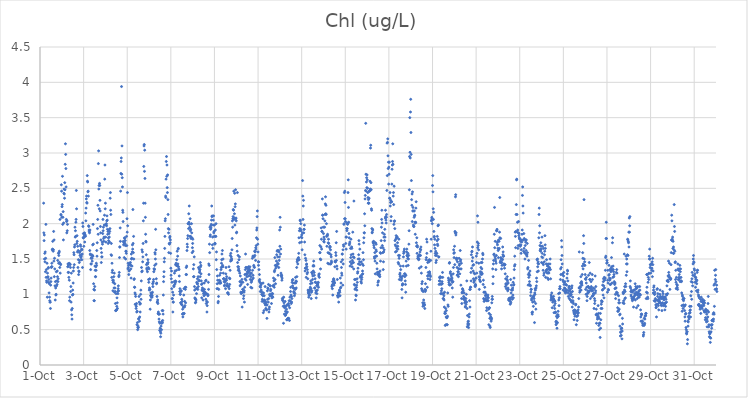
| Category | Chl (ug/L) |
|---|---|
| 44470.166666666664 | 2.29 |
| 44470.177083333336 | 1.87 |
| 44470.1875 | 1.76 |
| 44470.197916666664 | 1.84 |
| 44470.208333333336 | 1.5 |
| 44470.21875 | 1.58 |
| 44470.229166666664 | 1.46 |
| 44470.239583333336 | 1.6 |
| 44470.25 | 1.32 |
| 44470.260416666664 | 1.51 |
| 44470.270833333336 | 1.99 |
| 44470.28125 | 1.24 |
| 44470.291666666664 | 1.35 |
| 44470.302083333336 | 1.19 |
| 44470.3125 | 1.17 |
| 44470.322916666664 | 1.44 |
| 44470.333333333336 | 0.96 |
| 44470.34375 | 1.3 |
| 44470.354166666664 | 1.24 |
| 44470.364583333336 | 1.25 |
| 44470.375 | 1.37 |
| 44470.385416666664 | 1.38 |
| 44470.395833333336 | 1.17 |
| 44470.40625 | 1.21 |
| 44470.416666666664 | 1.02 |
| 44470.427083333336 | 1.15 |
| 44470.4375 | 0.96 |
| 44470.447916666664 | 0.91 |
| 44470.458333333336 | 0.89 |
| 44470.46875 | 0.89 |
| 44470.479166666664 | 0.8 |
| 44470.489583333336 | 1.13 |
| 44470.5 | 1.18 |
| 44470.510416666664 | 1.23 |
| 44470.520833333336 | 1.38 |
| 44470.53125 | 1.39 |
| 44470.541666666664 | 1.44 |
| 44470.552083333336 | 1.39 |
| 44470.5625 | 1.63 |
| 44470.572916666664 | 1.64 |
| 44470.583333333336 | 1.75 |
| 44470.59375 | 1.63 |
| 44470.604166666664 | 1.61 |
| 44470.614583333336 | 1.63 |
| 44470.625 | 1.89 |
| 44470.635416666664 | 1.47 |
| 44470.645833333336 | 1.77 |
| 44470.65625 | 1.25 |
| 44470.666666666664 | 1.51 |
| 44470.677083333336 | 1.36 |
| 44470.6875 | 1.12 |
| 44470.697916666664 | 0.92 |
| 44470.708333333336 | 1.18 |
| 44470.71875 | 1.09 |
| 44470.729166666664 | 0.99 |
| 44470.739583333336 | 1 |
| 44470.75 | 1.32 |
| 44470.760416666664 | 1.12 |
| 44470.770833333336 | 1.19 |
| 44470.78125 | 1.14 |
| 44470.791666666664 | 1.33 |
| 44470.802083333336 | 1.25 |
| 44470.8125 | 1.48 |
| 44470.822916666664 | 1.18 |
| 44470.833333333336 | 1.22 |
| 44470.84375 | 1.58 |
| 44470.854166666664 | 1.44 |
| 44470.864583333336 | 1.55 |
| 44470.875 | 1.59 |
| 44470.885416666664 | 1.61 |
| 44470.895833333336 | 1.45 |
| 44470.90625 | 1.38 |
| 44470.916666666664 | 2.06 |
| 44470.927083333336 | 1.3 |
| 44470.9375 | 1.43 |
| 44470.947916666664 | 1.42 |
| 44470.958333333336 | 2.13 |
| 44470.96875 | 2.12 |
| 44470.979166666664 | 2.55 |
| 44470.989583333336 | 2.46 |
| 44471.0 | 2.09 |
| 44471.010416666664 | 2.24 |
| 44471.020833333336 | 2.27 |
| 44471.03125 | 2.67 |
| 44471.041666666664 | 1.99 |
| 44471.052083333336 | 2.09 |
| 44471.0625 | 2.17 |
| 44471.072916666664 | 1.77 |
| 44471.083333333336 | 2.01 |
| 44471.09375 | 2.43 |
| 44471.104166666664 | 2.49 |
| 44471.114583333336 | 2.42 |
| 44471.125 | 2.36 |
| 44471.135416666664 | 2.58 |
| 44471.145833333336 | 2.48 |
| 44471.15625 | 2.84 |
| 44471.166666666664 | 3.13 |
| 44471.177083333336 | 2.98 |
| 44471.1875 | 2.78 |
| 44471.197916666664 | 2.52 |
| 44471.208333333336 | 2.06 |
| 44471.21875 | 2.03 |
| 44471.229166666664 | 1.87 |
| 44471.239583333336 | 2.04 |
| 44471.25 | 1.9 |
| 44471.260416666664 | 1.99 |
| 44471.270833333336 | 1.39 |
| 44471.28125 | 1.43 |
| 44471.291666666664 | 1.31 |
| 44471.302083333336 | 1.4 |
| 44471.3125 | 1.31 |
| 44471.322916666664 | 1.24 |
| 44471.333333333336 | 1.44 |
| 44471.34375 | 1.2 |
| 44471.354166666664 | 0.91 |
| 44471.364583333336 | 0.96 |
| 44471.375 | 1.43 |
| 44471.385416666664 | 1.42 |
| 44471.395833333336 | 1.38 |
| 44471.40625 | 1.04 |
| 44471.416666666664 | 1.11 |
| 44471.427083333336 | 0.89 |
| 44471.4375 | 1.3 |
| 44471.447916666664 | 0.78 |
| 44471.458333333336 | 0.71 |
| 44471.46875 | 0.65 |
| 44471.479166666664 | 0.8 |
| 44471.489583333336 | 0.99 |
| 44471.5 | 1.06 |
| 44471.510416666664 | 1 |
| 44471.520833333336 | 1.16 |
| 44471.53125 | 1.33 |
| 44471.541666666664 | 1.38 |
| 44471.552083333336 | 1.59 |
| 44471.5625 | 1.56 |
| 44471.572916666664 | 1.42 |
| 44471.583333333336 | 1.67 |
| 44471.59375 | 1.7 |
| 44471.604166666664 | 1.95 |
| 44471.614583333336 | 1.81 |
| 44471.625 | 1.9 |
| 44471.635416666664 | 1.82 |
| 44471.645833333336 | 2.02 |
| 44471.65625 | 2.06 |
| 44471.666666666664 | 2.47 |
| 44471.677083333336 | 2.21 |
| 44471.6875 | 1.72 |
| 44471.697916666664 | 1.83 |
| 44471.708333333336 | 1.75 |
| 44471.71875 | 1.6 |
| 44471.729166666664 | 1.68 |
| 44471.739583333336 | 1.38 |
| 44471.75 | 1.62 |
| 44471.760416666664 | 1.49 |
| 44471.770833333336 | 1.28 |
| 44471.78125 | 1.33 |
| 44471.791666666664 | 1.32 |
| 44471.802083333336 | 1.45 |
| 44471.8125 | 1.59 |
| 44471.822916666664 | 1.48 |
| 44471.833333333336 | 1.55 |
| 44471.84375 | 1.61 |
| 44471.854166666664 | 1.7 |
| 44471.864583333336 | 1.68 |
| 44471.875 | 1.52 |
| 44471.885416666664 | 1.56 |
| 44471.895833333336 | 1.54 |
| 44471.90625 | 1.64 |
| 44471.916666666664 | 1.49 |
| 44471.927083333336 | 1.63 |
| 44471.9375 | 1.57 |
| 44471.947916666664 | 1.38 |
| 44471.958333333336 | 2.01 |
| 44471.96875 | 1.96 |
| 44471.979166666664 | 1.8 |
| 44471.989583333336 | 1.86 |
| 44472.0 | 1.8 |
| 44472.010416666664 | 1.68 |
| 44472.020833333336 | 1.82 |
| 44472.03125 | 1.86 |
| 44472.041666666664 | 1.87 |
| 44472.052083333336 | 1.74 |
| 44472.0625 | 1.83 |
| 44472.072916666664 | 1.84 |
| 44472.083333333336 | 1.82 |
| 44472.09375 | 2.15 |
| 44472.104166666664 | 2.04 |
| 44472.114583333336 | 2.22 |
| 44472.125 | 2.35 |
| 44472.135416666664 | 2.39 |
| 44472.145833333336 | 2.3 |
| 44472.15625 | 2.29 |
| 44472.166666666664 | 2.68 |
| 44472.177083333336 | 2.6 |
| 44472.1875 | 2.59 |
| 44472.197916666664 | 2.45 |
| 44472.208333333336 | 2.46 |
| 44472.21875 | 2.39 |
| 44472.229166666664 | 1.97 |
| 44472.239583333336 | 1.96 |
| 44472.25 | 1.91 |
| 44472.260416666664 | 1.89 |
| 44472.270833333336 | 1.87 |
| 44472.28125 | 1.62 |
| 44472.291666666664 | 1.91 |
| 44472.302083333336 | 1.57 |
| 44472.3125 | 1.56 |
| 44472.322916666664 | 1.35 |
| 44472.333333333336 | 1.43 |
| 44472.34375 | 1.51 |
| 44472.354166666664 | 1.43 |
| 44472.364583333336 | 1.52 |
| 44472.375 | 1.56 |
| 44472.385416666664 | 1.51 |
| 44472.395833333336 | 1.47 |
| 44472.40625 | 1.55 |
| 44472.416666666664 | 1.7 |
| 44472.427083333336 | 1.54 |
| 44472.4375 | 1.99 |
| 44472.447916666664 | 1.71 |
| 44472.458333333336 | 1.15 |
| 44472.46875 | 1.07 |
| 44472.479166666664 | 0.91 |
| 44472.489583333336 | 0.91 |
| 44472.5 | 1.06 |
| 44472.510416666664 | 1.11 |
| 44472.520833333336 | 1.4 |
| 44472.53125 | 1.34 |
| 44472.541666666664 | 1.25 |
| 44472.552083333336 | 1.25 |
| 44472.5625 | 1.39 |
| 44472.572916666664 | 1.34 |
| 44472.583333333336 | 1.44 |
| 44472.59375 | 1.41 |
| 44472.604166666664 | 1.62 |
| 44472.614583333336 | 1.54 |
| 44472.625 | 1.73 |
| 44472.635416666664 | 1.93 |
| 44472.645833333336 | 2.06 |
| 44472.65625 | 2.26 |
| 44472.666666666664 | 1.85 |
| 44472.677083333336 | 2.85 |
| 44472.6875 | 3.03 |
| 44472.697916666664 | 2.49 |
| 44472.708333333336 | 2.54 |
| 44472.71875 | 2.21 |
| 44472.729166666664 | 2.57 |
| 44472.739583333336 | 2.54 |
| 44472.75 | 2.33 |
| 44472.760416666664 | 2.18 |
| 44472.770833333336 | 1.96 |
| 44472.78125 | 1.87 |
| 44472.791666666664 | 1.77 |
| 44472.802083333336 | 1.65 |
| 44472.8125 | 1.45 |
| 44472.822916666664 | 1.59 |
| 44472.833333333336 | 1.53 |
| 44472.84375 | 1.53 |
| 44472.854166666664 | 1.74 |
| 44472.864583333336 | 1.71 |
| 44472.875 | 1.86 |
| 44472.885416666664 | 2.06 |
| 44472.895833333336 | 1.9 |
| 44472.90625 | 1.95 |
| 44472.916666666664 | 1.79 |
| 44472.927083333336 | 1.75 |
| 44472.9375 | 1.81 |
| 44472.947916666664 | 1.98 |
| 44472.958333333336 | 2.12 |
| 44472.96875 | 2.63 |
| 44472.979166666664 | 2.83 |
| 44472.989583333336 | 2.21 |
| 44473.0 | 2.29 |
| 44473.010416666664 | 1.81 |
| 44473.020833333336 | 1.74 |
| 44473.03125 | 1.99 |
| 44473.041666666664 | 2 |
| 44473.052083333336 | 1.97 |
| 44473.0625 | 2.04 |
| 44473.072916666664 | 2.11 |
| 44473.083333333336 | 2.05 |
| 44473.09375 | 1.92 |
| 44473.104166666664 | 1.85 |
| 44473.114583333336 | 1.89 |
| 44473.125 | 1.72 |
| 44473.135416666664 | 1.8 |
| 44473.145833333336 | 1.76 |
| 44473.15625 | 1.91 |
| 44473.166666666664 | 1.86 |
| 44473.177083333336 | 1.81 |
| 44473.1875 | 1.74 |
| 44473.197916666664 | 1.89 |
| 44473.208333333336 | 1.93 |
| 44473.21875 | 2.36 |
| 44473.229166666664 | 2.44 |
| 44473.239583333336 | 2.19 |
| 44473.25 | 2.13 |
| 44473.260416666664 | 1.56 |
| 44473.270833333336 | 1.72 |
| 44473.28125 | 1.55 |
| 44473.291666666664 | 1.24 |
| 44473.302083333336 | 1.44 |
| 44473.3125 | 1.31 |
| 44473.322916666664 | 1.34 |
| 44473.333333333336 | 1.2 |
| 44473.34375 | 1.05 |
| 44473.354166666664 | 1.17 |
| 44473.364583333336 | 1.2 |
| 44473.375 | 1.17 |
| 44473.385416666664 | 1.25 |
| 44473.395833333336 | 1.09 |
| 44473.40625 | 1.3 |
| 44473.416666666664 | 1.03 |
| 44473.427083333336 | 1.15 |
| 44473.4375 | 1.09 |
| 44473.447916666664 | 1.04 |
| 44473.458333333336 | 0.87 |
| 44473.46875 | 0.77 |
| 44473.479166666664 | 0.77 |
| 44473.489583333336 | 1.01 |
| 44473.5 | 0.78 |
| 44473.510416666664 | 0.78 |
| 44473.520833333336 | 0.83 |
| 44473.53125 | 0.95 |
| 44473.541666666664 | 0.88 |
| 44473.552083333336 | 0.8 |
| 44473.5625 | 1.04 |
| 44473.572916666664 | 1.01 |
| 44473.583333333336 | 1.08 |
| 44473.59375 | 1.12 |
| 44473.604166666664 | 1.05 |
| 44473.614583333336 | 1.25 |
| 44473.625 | 1.27 |
| 44473.635416666664 | 1.31 |
| 44473.645833333336 | 1.52 |
| 44473.65625 | 1.67 |
| 44473.666666666664 | 1.67 |
| 44473.677083333336 | 1.94 |
| 44473.6875 | 1.75 |
| 44473.697916666664 | 2.46 |
| 44473.708333333336 | 2.71 |
| 44473.71875 | 2.88 |
| 44473.729166666664 | 2.93 |
| 44473.739583333336 | 3.94 |
| 44473.75 | 2.7 |
| 44473.760416666664 | 3.1 |
| 44473.770833333336 | 2.65 |
| 44473.78125 | 2.52 |
| 44473.791666666664 | 2.19 |
| 44473.802083333336 | 2.16 |
| 44473.8125 | 2.03 |
| 44473.822916666664 | 1.75 |
| 44473.833333333336 | 1.7 |
| 44473.84375 | 1.73 |
| 44473.854166666664 | 1.74 |
| 44473.864583333336 | 1.52 |
| 44473.875 | 1.8 |
| 44473.885416666664 | 1.79 |
| 44473.895833333336 | 1.72 |
| 44473.90625 | 1.76 |
| 44473.916666666664 | 1.69 |
| 44473.927083333336 | 1.5 |
| 44473.9375 | 1.61 |
| 44473.947916666664 | 1.61 |
| 44473.958333333336 | 1.58 |
| 44473.96875 | 1.82 |
| 44473.979166666664 | 1.69 |
| 44473.989583333336 | 2.07 |
| 44474.0 | 1.88 |
| 44474.010416666664 | 2.44 |
| 44474.020833333336 | 1.97 |
| 44474.03125 | 1.36 |
| 44474.041666666664 | 1.44 |
| 44474.052083333336 | 1.38 |
| 44474.0625 | 1.41 |
| 44474.072916666664 | 1.28 |
| 44474.083333333336 | 1.33 |
| 44474.09375 | 1.42 |
| 44474.104166666664 | 1.34 |
| 44474.114583333336 | 1.44 |
| 44474.125 | 1.42 |
| 44474.135416666664 | 1.42 |
| 44474.145833333336 | 1.45 |
| 44474.15625 | 1.41 |
| 44474.166666666664 | 1.36 |
| 44474.177083333336 | 1.23 |
| 44474.1875 | 1.57 |
| 44474.197916666664 | 1.5 |
| 44474.208333333336 | 1.51 |
| 44474.21875 | 1.4 |
| 44474.229166666664 | 1.6 |
| 44474.239583333336 | 1.7 |
| 44474.25 | 1.64 |
| 44474.260416666664 | 2.2 |
| 44474.270833333336 | 1.72 |
| 44474.28125 | 1.59 |
| 44474.291666666664 | 1.82 |
| 44474.302083333336 | 1.5 |
| 44474.3125 | 1.21 |
| 44474.322916666664 | 1.22 |
| 44474.333333333336 | 1.1 |
| 44474.34375 | 1.1 |
| 44474.354166666664 | 1.02 |
| 44474.364583333336 | 0.86 |
| 44474.375 | 1 |
| 44474.385416666664 | 0.97 |
| 44474.395833333336 | 0.85 |
| 44474.40625 | 0.8 |
| 44474.416666666664 | 0.83 |
| 44474.427083333336 | 0.87 |
| 44474.4375 | 0.75 |
| 44474.447916666664 | 0.57 |
| 44474.458333333336 | 0.76 |
| 44474.46875 | 0.6 |
| 44474.479166666664 | 0.5 |
| 44474.489583333336 | 0.53 |
| 44474.5 | 0.55 |
| 44474.510416666664 | 0.53 |
| 44474.520833333336 | 0.65 |
| 44474.53125 | 0.66 |
| 44474.541666666664 | 0.97 |
| 44474.552083333336 | 0.89 |
| 44474.5625 | 0.62 |
| 44474.572916666664 | 0.68 |
| 44474.583333333336 | 0.86 |
| 44474.59375 | 0.75 |
| 44474.604166666664 | 0.87 |
| 44474.614583333336 | 1 |
| 44474.625 | 1.06 |
| 44474.635416666664 | 0.93 |
| 44474.645833333336 | 1.19 |
| 44474.65625 | 1.38 |
| 44474.666666666664 | 1.32 |
| 44474.677083333336 | 1.63 |
| 44474.6875 | 1.33 |
| 44474.697916666664 | 1.6 |
| 44474.708333333336 | 1.46 |
| 44474.71875 | 1.53 |
| 44474.729166666664 | 1.72 |
| 44474.739583333336 | 2.04 |
| 44474.75 | 2.29 |
| 44474.760416666664 | 2.81 |
| 44474.770833333336 | 3.1 |
| 44474.78125 | 3.12 |
| 44474.791666666664 | 2.74 |
| 44474.802083333336 | 3.04 |
| 44474.8125 | 2.64 |
| 44474.822916666664 | 2.29 |
| 44474.833333333336 | 2.09 |
| 44474.84375 | 1.85 |
| 44474.854166666664 | 1.75 |
| 44474.864583333336 | 1.74 |
| 44474.875 | 1.56 |
| 44474.885416666664 | 1.42 |
| 44474.895833333336 | 1.37 |
| 44474.90625 | 1.35 |
| 44474.916666666664 | 1.44 |
| 44474.927083333336 | 1.32 |
| 44474.9375 | 1.43 |
| 44474.947916666664 | 1.49 |
| 44474.958333333336 | 1.45 |
| 44474.96875 | 1.38 |
| 44474.979166666664 | 1.21 |
| 44474.989583333336 | 1.17 |
| 44475.0 | 1.36 |
| 44475.010416666664 | 1.06 |
| 44475.020833333336 | 1.09 |
| 44475.03125 | 1.22 |
| 44475.041666666664 | 1.07 |
| 44475.052083333336 | 0.79 |
| 44475.0625 | 0.92 |
| 44475.072916666664 | 0.98 |
| 44475.083333333336 | 1.02 |
| 44475.09375 | 0.99 |
| 44475.104166666664 | 0.98 |
| 44475.114583333336 | 0.96 |
| 44475.125 | 1.01 |
| 44475.135416666664 | 0.96 |
| 44475.145833333336 | 0.98 |
| 44475.15625 | 1.03 |
| 44475.166666666664 | 1.15 |
| 44475.177083333336 | 1.11 |
| 44475.1875 | 1.16 |
| 44475.197916666664 | 1.18 |
| 44475.208333333336 | 1.21 |
| 44475.21875 | 1.32 |
| 44475.229166666664 | 1.36 |
| 44475.239583333336 | 1.36 |
| 44475.25 | 1.35 |
| 44475.260416666664 | 1.41 |
| 44475.270833333336 | 1.59 |
| 44475.28125 | 1.57 |
| 44475.291666666664 | 1.5 |
| 44475.302083333336 | 1.92 |
| 44475.3125 | 1.63 |
| 44475.322916666664 | 1.43 |
| 44475.333333333336 | 1.22 |
| 44475.34375 | 1.15 |
| 44475.354166666664 | 1.16 |
| 44475.364583333336 | 0.97 |
| 44475.375 | 0.89 |
| 44475.385416666664 | 0.89 |
| 44475.395833333336 | 0.92 |
| 44475.40625 | 0.87 |
| 44475.416666666664 | 0.73 |
| 44475.427083333336 | 0.75 |
| 44475.4375 | 0.72 |
| 44475.447916666664 | 0.72 |
| 44475.458333333336 | 0.65 |
| 44475.46875 | 0.61 |
| 44475.479166666664 | 0.72 |
| 44475.489583333336 | 0.49 |
| 44475.5 | 0.59 |
| 44475.510416666664 | 0.52 |
| 44475.520833333336 | 0.47 |
| 44475.53125 | 0.4 |
| 44475.541666666664 | 0.45 |
| 44475.552083333336 | 0.55 |
| 44475.5625 | 0.6 |
| 44475.572916666664 | 0.5 |
| 44475.583333333336 | 0.59 |
| 44475.59375 | 0.62 |
| 44475.604166666664 | 0.77 |
| 44475.614583333336 | 0.6 |
| 44475.625 | 0.63 |
| 44475.635416666664 | 0.77 |
| 44475.645833333336 | 0.72 |
| 44475.65625 | 0.99 |
| 44475.666666666664 | 1.18 |
| 44475.677083333336 | 1.25 |
| 44475.6875 | 1.32 |
| 44475.697916666664 | 1.46 |
| 44475.708333333336 | 1.51 |
| 44475.71875 | 1.65 |
| 44475.729166666664 | 1.82 |
| 44475.739583333336 | 2.04 |
| 44475.75 | 2.07 |
| 44475.760416666664 | 2.39 |
| 44475.770833333336 | 2.37 |
| 44475.78125 | 2.63 |
| 44475.791666666664 | 2.88 |
| 44475.802083333336 | 2.95 |
| 44475.8125 | 2.67 |
| 44475.822916666664 | 2.83 |
| 44475.833333333336 | 2.51 |
| 44475.84375 | 2.44 |
| 44475.854166666664 | 2.69 |
| 44475.864583333336 | 2.34 |
| 44475.875 | 2.13 |
| 44475.885416666664 | 1.93 |
| 44475.895833333336 | 1.87 |
| 44475.90625 | 1.59 |
| 44475.916666666664 | 1.92 |
| 44475.927083333336 | 1.72 |
| 44475.9375 | 1.71 |
| 44475.947916666664 | 1.8 |
| 44475.958333333336 | 1.82 |
| 44475.96875 | 1.73 |
| 44475.979166666664 | 1.77 |
| 44475.989583333336 | 1.58 |
| 44476.0 | 1.37 |
| 44476.010416666664 | 1.27 |
| 44476.020833333336 | 1.22 |
| 44476.03125 | 1.33 |
| 44476.041666666664 | 1.08 |
| 44476.052083333336 | 1.17 |
| 44476.0625 | 0.94 |
| 44476.072916666664 | 0.94 |
| 44476.083333333336 | 1.03 |
| 44476.09375 | 0.75 |
| 44476.104166666664 | 0.89 |
| 44476.114583333336 | 0.89 |
| 44476.125 | 0.99 |
| 44476.135416666664 | 1.12 |
| 44476.145833333336 | 1.11 |
| 44476.15625 | 1.18 |
| 44476.166666666664 | 1.3 |
| 44476.177083333336 | 1.14 |
| 44476.1875 | 1.33 |
| 44476.197916666664 | 1.16 |
| 44476.208333333336 | 1.19 |
| 44476.21875 | 1.42 |
| 44476.229166666664 | 1.18 |
| 44476.239583333336 | 1.44 |
| 44476.25 | 1.41 |
| 44476.260416666664 | 1.34 |
| 44476.270833333336 | 1.49 |
| 44476.28125 | 1.41 |
| 44476.291666666664 | 1.61 |
| 44476.302083333336 | 1.4 |
| 44476.3125 | 1.54 |
| 44476.322916666664 | 1.43 |
| 44476.333333333336 | 1.64 |
| 44476.34375 | 1.65 |
| 44476.354166666664 | 1.39 |
| 44476.364583333336 | 1.36 |
| 44476.375 | 1.35 |
| 44476.385416666664 | 1.26 |
| 44476.395833333336 | 1.18 |
| 44476.40625 | 1.04 |
| 44476.416666666664 | 1.08 |
| 44476.427083333336 | 1 |
| 44476.4375 | 1 |
| 44476.447916666664 | 0.88 |
| 44476.458333333336 | 1.04 |
| 44476.46875 | 0.88 |
| 44476.479166666664 | 1.05 |
| 44476.489583333336 | 0.86 |
| 44476.5 | 0.93 |
| 44476.510416666664 | 0.85 |
| 44476.520833333336 | 0.9 |
| 44476.53125 | 0.72 |
| 44476.541666666664 | 0.79 |
| 44476.552083333336 | 0.68 |
| 44476.5625 | 0.73 |
| 44476.572916666664 | 0.82 |
| 44476.583333333336 | 0.72 |
| 44476.59375 | 0.99 |
| 44476.604166666664 | 1.08 |
| 44476.614583333336 | 0.73 |
| 44476.625 | 0.82 |
| 44476.635416666664 | 0.9 |
| 44476.645833333336 | 0.84 |
| 44476.65625 | 1.1 |
| 44476.666666666664 | 1.07 |
| 44476.677083333336 | 0.88 |
| 44476.6875 | 1.1 |
| 44476.697916666664 | 1.28 |
| 44476.708333333336 | 1.38 |
| 44476.71875 | 1.28 |
| 44476.729166666664 | 1.4 |
| 44476.739583333336 | 1.62 |
| 44476.75 | 1.71 |
| 44476.760416666664 | 1.67 |
| 44476.770833333336 | 1.79 |
| 44476.78125 | 1.83 |
| 44476.791666666664 | 2 |
| 44476.802083333336 | 2 |
| 44476.8125 | 1.93 |
| 44476.822916666664 | 2.14 |
| 44476.833333333336 | 2.02 |
| 44476.84375 | 2.25 |
| 44476.854166666664 | 1.99 |
| 44476.864583333336 | 1.95 |
| 44476.875 | 1.82 |
| 44476.885416666664 | 2.07 |
| 44476.895833333336 | 1.9 |
| 44476.90625 | 1.82 |
| 44476.916666666664 | 1.92 |
| 44476.927083333336 | 1.79 |
| 44476.9375 | 1.8 |
| 44476.947916666664 | 2 |
| 44476.958333333336 | 1.87 |
| 44476.96875 | 1.8 |
| 44476.979166666664 | 1.59 |
| 44476.989583333336 | 1.66 |
| 44477.0 | 1.72 |
| 44477.010416666664 | 1.78 |
| 44477.020833333336 | 1.61 |
| 44477.03125 | 1.36 |
| 44477.041666666664 | 1.25 |
| 44477.052083333336 | 1.42 |
| 44477.0625 | 1.25 |
| 44477.072916666664 | 1.53 |
| 44477.083333333336 | 1.11 |
| 44477.09375 | 1.06 |
| 44477.104166666664 | 0.95 |
| 44477.114583333336 | 0.94 |
| 44477.125 | 0.88 |
| 44477.135416666664 | 0.93 |
| 44477.145833333336 | 0.89 |
| 44477.15625 | 0.92 |
| 44477.166666666664 | 1.08 |
| 44477.177083333336 | 1.01 |
| 44477.1875 | 1.17 |
| 44477.197916666664 | 1.09 |
| 44477.208333333336 | 1.15 |
| 44477.21875 | 1.22 |
| 44477.229166666664 | 1.15 |
| 44477.239583333336 | 1.07 |
| 44477.25 | 1.25 |
| 44477.260416666664 | 1.11 |
| 44477.270833333336 | 1.38 |
| 44477.28125 | 1.19 |
| 44477.291666666664 | 1.36 |
| 44477.302083333336 | 1.2 |
| 44477.3125 | 1.31 |
| 44477.322916666664 | 1.33 |
| 44477.333333333336 | 1.35 |
| 44477.34375 | 1.25 |
| 44477.354166666664 | 1.45 |
| 44477.364583333336 | 1.39 |
| 44477.375 | 1.41 |
| 44477.385416666664 | 1.29 |
| 44477.395833333336 | 1.19 |
| 44477.40625 | 1.14 |
| 44477.416666666664 | 0.95 |
| 44477.427083333336 | 1.06 |
| 44477.4375 | 1.15 |
| 44477.447916666664 | 1.09 |
| 44477.458333333336 | 1.05 |
| 44477.46875 | 1.06 |
| 44477.479166666664 | 0.92 |
| 44477.489583333336 | 1.07 |
| 44477.5 | 1.01 |
| 44477.510416666664 | 1.04 |
| 44477.520833333336 | 0.98 |
| 44477.53125 | 1.16 |
| 44477.541666666664 | 1.07 |
| 44477.552083333336 | 1.03 |
| 44477.5625 | 1.01 |
| 44477.572916666664 | 1.03 |
| 44477.583333333336 | 1 |
| 44477.59375 | 1.19 |
| 44477.604166666664 | 0.93 |
| 44477.614583333336 | 1.2 |
| 44477.625 | 0.87 |
| 44477.635416666664 | 1.01 |
| 44477.645833333336 | 0.9 |
| 44477.65625 | 0.75 |
| 44477.666666666664 | 0.84 |
| 44477.677083333336 | 0.89 |
| 44477.6875 | 1 |
| 44477.697916666664 | 0.98 |
| 44477.708333333336 | 0.99 |
| 44477.71875 | 1.17 |
| 44477.729166666664 | 1.07 |
| 44477.739583333336 | 1.43 |
| 44477.75 | 1.28 |
| 44477.760416666664 | 1.41 |
| 44477.770833333336 | 1.71 |
| 44477.78125 | 1.59 |
| 44477.791666666664 | 1.95 |
| 44477.802083333336 | 1.82 |
| 44477.8125 | 1.84 |
| 44477.822916666664 | 1.92 |
| 44477.833333333336 | 1.97 |
| 44477.84375 | 1.94 |
| 44477.854166666664 | 1.99 |
| 44477.864583333336 | 2.05 |
| 44477.875 | 2.25 |
| 44477.885416666664 | 2.1 |
| 44477.895833333336 | 2.11 |
| 44477.90625 | 1.7 |
| 44477.916666666664 | 1.81 |
| 44477.927083333336 | 1.65 |
| 44477.9375 | 1.98 |
| 44477.947916666664 | 2.05 |
| 44477.958333333336 | 2.11 |
| 44477.96875 | 1.87 |
| 44477.979166666664 | 1.89 |
| 44477.989583333336 | 1.82 |
| 44478.0 | 1.98 |
| 44478.010416666664 | 1.72 |
| 44478.020833333336 | 1.71 |
| 44478.03125 | 1.72 |
| 44478.041666666664 | 1.91 |
| 44478.052083333336 | 1.82 |
| 44478.0625 | 1.82 |
| 44478.072916666664 | 2 |
| 44478.083333333336 | 1.49 |
| 44478.09375 | 1.6 |
| 44478.104166666664 | 1.35 |
| 44478.114583333336 | 1.08 |
| 44478.125 | 1.15 |
| 44478.135416666664 | 1.26 |
| 44478.145833333336 | 1.2 |
| 44478.15625 | 1.08 |
| 44478.166666666664 | 0.88 |
| 44478.177083333336 | 0.9 |
| 44478.1875 | 0.97 |
| 44478.197916666664 | 1.07 |
| 44478.208333333336 | 1.16 |
| 44478.21875 | 1.2 |
| 44478.229166666664 | 1.16 |
| 44478.239583333336 | 1.27 |
| 44478.25 | 1.18 |
| 44478.260416666664 | 1.19 |
| 44478.270833333336 | 1.16 |
| 44478.28125 | 1.3 |
| 44478.291666666664 | 1.16 |
| 44478.302083333336 | 1.35 |
| 44478.3125 | 1.38 |
| 44478.322916666664 | 1.44 |
| 44478.333333333336 | 1.49 |
| 44478.34375 | 1.57 |
| 44478.354166666664 | 1.39 |
| 44478.364583333336 | 1.62 |
| 44478.375 | 1.41 |
| 44478.385416666664 | 1.39 |
| 44478.395833333336 | 1.5 |
| 44478.40625 | 1.3 |
| 44478.416666666664 | 1.22 |
| 44478.427083333336 | 1.22 |
| 44478.4375 | 1.22 |
| 44478.447916666664 | 1.18 |
| 44478.458333333336 | 1.12 |
| 44478.46875 | 1.13 |
| 44478.479166666664 | 1.17 |
| 44478.489583333336 | 1.19 |
| 44478.5 | 1.19 |
| 44478.510416666664 | 1.08 |
| 44478.520833333336 | 1.29 |
| 44478.53125 | 1.38 |
| 44478.541666666664 | 1.22 |
| 44478.552083333336 | 1.2 |
| 44478.5625 | 1.25 |
| 44478.572916666664 | 1.12 |
| 44478.583333333336 | 1.15 |
| 44478.59375 | 1.12 |
| 44478.604166666664 | 1.02 |
| 44478.614583333336 | 1.02 |
| 44478.625 | 1.02 |
| 44478.635416666664 | 1.11 |
| 44478.645833333336 | 1 |
| 44478.65625 | 1.11 |
| 44478.666666666664 | 1.39 |
| 44478.677083333336 | 1.08 |
| 44478.6875 | 1.23 |
| 44478.697916666664 | 1.14 |
| 44478.708333333336 | 1.22 |
| 44478.71875 | 1.34 |
| 44478.729166666664 | 1.55 |
| 44478.739583333336 | 1.47 |
| 44478.75 | 1.58 |
| 44478.760416666664 | 1.49 |
| 44478.770833333336 | 1.53 |
| 44478.78125 | 1.48 |
| 44478.791666666664 | 1.5 |
| 44478.802083333336 | 1.63 |
| 44478.8125 | 1.79 |
| 44478.822916666664 | 2.04 |
| 44478.833333333336 | 1.95 |
| 44478.84375 | 2.07 |
| 44478.854166666664 | 2.1 |
| 44478.864583333336 | 2.2 |
| 44478.875 | 2.19 |
| 44478.885416666664 | 2.46 |
| 44478.895833333336 | 2.06 |
| 44478.90625 | 2.08 |
| 44478.916666666664 | 2.14 |
| 44478.927083333336 | 2.43 |
| 44478.9375 | 1.98 |
| 44478.947916666664 | 2.24 |
| 44478.958333333336 | 2.28 |
| 44478.96875 | 2.48 |
| 44478.979166666664 | 2.07 |
| 44478.989583333336 | 2.08 |
| 44479.0 | 2.04 |
| 44479.010416666664 | 1.87 |
| 44479.020833333336 | 1.88 |
| 44479.03125 | 1.69 |
| 44479.041666666664 | 1.61 |
| 44479.052083333336 | 2.44 |
| 44479.0625 | 1.45 |
| 44479.072916666664 | 1.39 |
| 44479.083333333336 | 1.55 |
| 44479.09375 | 1.34 |
| 44479.104166666664 | 1.39 |
| 44479.114583333336 | 1.36 |
| 44479.125 | 1.49 |
| 44479.135416666664 | 1.33 |
| 44479.145833333336 | 1.53 |
| 44479.15625 | 1.3 |
| 44479.166666666664 | 1.18 |
| 44479.177083333336 | 1.12 |
| 44479.1875 | 1.26 |
| 44479.197916666664 | 1.18 |
| 44479.208333333336 | 1.03 |
| 44479.21875 | 1.14 |
| 44479.229166666664 | 1.01 |
| 44479.239583333336 | 1.02 |
| 44479.25 | 1.17 |
| 44479.260416666664 | 1.21 |
| 44479.270833333336 | 0.82 |
| 44479.28125 | 1.03 |
| 44479.291666666664 | 1.07 |
| 44479.302083333336 | 1.17 |
| 44479.3125 | 1.07 |
| 44479.322916666664 | 1.04 |
| 44479.333333333336 | 0.94 |
| 44479.34375 | 0.98 |
| 44479.354166666664 | 1.03 |
| 44479.364583333336 | 1.05 |
| 44479.375 | 0.89 |
| 44479.385416666664 | 1.1 |
| 44479.395833333336 | 1.28 |
| 44479.40625 | 1.22 |
| 44479.416666666664 | 1.35 |
| 44479.427083333336 | 1.57 |
| 44479.4375 | 1.38 |
| 44479.447916666664 | 1.2 |
| 44479.458333333336 | 1.29 |
| 44479.46875 | 1.28 |
| 44479.479166666664 | 1.38 |
| 44479.489583333336 | 1.25 |
| 44479.5 | 1.29 |
| 44479.510416666664 | 1.32 |
| 44479.520833333336 | 1.14 |
| 44479.53125 | 1.36 |
| 44479.541666666664 | 1.33 |
| 44479.552083333336 | 1.31 |
| 44479.5625 | 1.39 |
| 44479.572916666664 | 1.26 |
| 44479.583333333336 | 1.37 |
| 44479.59375 | 1.33 |
| 44479.604166666664 | 1.34 |
| 44479.614583333336 | 1.35 |
| 44479.625 | 1.39 |
| 44479.635416666664 | 1.28 |
| 44479.645833333336 | 1.21 |
| 44479.65625 | 1.3 |
| 44479.666666666664 | 1.1 |
| 44479.677083333336 | 1.25 |
| 44479.6875 | 1.17 |
| 44479.697916666664 | 1.3 |
| 44479.708333333336 | 1.19 |
| 44479.71875 | 1.09 |
| 44479.729166666664 | 1.21 |
| 44479.739583333336 | 1.51 |
| 44479.75 | 1.34 |
| 44479.760416666664 | 1.54 |
| 44479.770833333336 | 1.27 |
| 44479.78125 | 1.23 |
| 44479.791666666664 | 1.54 |
| 44479.802083333336 | 1.41 |
| 44479.8125 | 1.39 |
| 44479.822916666664 | 1.53 |
| 44479.833333333336 | 1.38 |
| 44479.84375 | 1.61 |
| 44479.854166666664 | 1.55 |
| 44479.864583333336 | 1.6 |
| 44479.875 | 1.61 |
| 44479.885416666664 | 1.48 |
| 44479.895833333336 | 1.66 |
| 44479.90625 | 1.64 |
| 44479.916666666664 | 1.69 |
| 44479.927083333336 | 1.8 |
| 44479.9375 | 1.91 |
| 44479.947916666664 | 1.94 |
| 44479.958333333336 | 2.1 |
| 44479.96875 | 2.18 |
| 44479.979166666664 | 1.78 |
| 44479.989583333336 | 1.71 |
| 44480.0 | 1.6 |
| 44480.010416666664 | 1.46 |
| 44480.020833333336 | 1.41 |
| 44480.03125 | 1.46 |
| 44480.041666666664 | 1.35 |
| 44480.052083333336 | 1.19 |
| 44480.0625 | 1.28 |
| 44480.072916666664 | 1.21 |
| 44480.083333333336 | 1.17 |
| 44480.09375 | 1.11 |
| 44480.104166666664 | 1.04 |
| 44480.114583333336 | 1.1 |
| 44480.125 | 1.13 |
| 44480.135416666664 | 1.15 |
| 44480.145833333336 | 1.06 |
| 44480.15625 | 1.15 |
| 44480.166666666664 | 1 |
| 44480.177083333336 | 1.03 |
| 44480.1875 | 0.9 |
| 44480.197916666664 | 0.93 |
| 44480.208333333336 | 0.99 |
| 44480.21875 | 0.98 |
| 44480.229166666664 | 1.16 |
| 44480.239583333336 | 0.74 |
| 44480.25 | 1.02 |
| 44480.260416666664 | 0.9 |
| 44480.270833333336 | 0.77 |
| 44480.28125 | 0.98 |
| 44480.291666666664 | 0.92 |
| 44480.302083333336 | 0.87 |
| 44480.3125 | 0.91 |
| 44480.322916666664 | 1.11 |
| 44480.333333333336 | 0.85 |
| 44480.34375 | 0.87 |
| 44480.354166666664 | 0.8 |
| 44480.364583333336 | 0.89 |
| 44480.375 | 0.79 |
| 44480.385416666664 | 0.85 |
| 44480.395833333336 | 0.78 |
| 44480.40625 | 0.66 |
| 44480.416666666664 | 0.85 |
| 44480.427083333336 | 1.05 |
| 44480.4375 | 0.93 |
| 44480.447916666664 | 1.09 |
| 44480.458333333336 | 1.08 |
| 44480.46875 | 0.89 |
| 44480.479166666664 | 1.14 |
| 44480.489583333336 | 0.94 |
| 44480.5 | 0.75 |
| 44480.510416666664 | 0.79 |
| 44480.520833333336 | 0.82 |
| 44480.53125 | 1 |
| 44480.541666666664 | 0.98 |
| 44480.552083333336 | 1.12 |
| 44480.5625 | 1.12 |
| 44480.572916666664 | 1.05 |
| 44480.583333333336 | 1.07 |
| 44480.59375 | 0.98 |
| 44480.604166666664 | 1 |
| 44480.614583333336 | 0.87 |
| 44480.625 | 1 |
| 44480.635416666664 | 0.95 |
| 44480.645833333336 | 1.01 |
| 44480.65625 | 0.97 |
| 44480.666666666664 | 1.01 |
| 44480.677083333336 | 0.96 |
| 44480.6875 | 1.12 |
| 44480.697916666664 | 1.12 |
| 44480.708333333336 | 1.23 |
| 44480.71875 | 1.13 |
| 44480.729166666664 | 1.19 |
| 44480.739583333336 | 1.1 |
| 44480.75 | 1.32 |
| 44480.760416666664 | 1.34 |
| 44480.770833333336 | 1.52 |
| 44480.78125 | 1.21 |
| 44480.791666666664 | 1.41 |
| 44480.802083333336 | 1.15 |
| 44480.8125 | 1.37 |
| 44480.822916666664 | 1.4 |
| 44480.833333333336 | 1.41 |
| 44480.84375 | 1.47 |
| 44480.854166666664 | 1.56 |
| 44480.864583333336 | 1.4 |
| 44480.875 | 1.61 |
| 44480.885416666664 | 1.62 |
| 44480.895833333336 | 1.44 |
| 44480.90625 | 1.53 |
| 44480.916666666664 | 1.27 |
| 44480.927083333336 | 1.43 |
| 44480.9375 | 1.62 |
| 44480.947916666664 | 1.38 |
| 44480.958333333336 | 1.6 |
| 44480.96875 | 1.48 |
| 44480.979166666664 | 1.53 |
| 44480.989583333336 | 1.91 |
| 44481.0 | 1.68 |
| 44481.010416666664 | 2.09 |
| 44481.020833333336 | 1.95 |
| 44481.03125 | 1.57 |
| 44481.041666666664 | 1.64 |
| 44481.052083333336 | 1.3 |
| 44481.0625 | 1.27 |
| 44481.072916666664 | 1.25 |
| 44481.083333333336 | 1.27 |
| 44481.09375 | 1.2 |
| 44481.104166666664 | 1.23 |
| 44481.114583333336 | 0.94 |
| 44481.125 | 0.92 |
| 44481.135416666664 | 0.91 |
| 44481.145833333336 | 0.95 |
| 44481.15625 | 0.83 |
| 44481.166666666664 | 0.59 |
| 44481.177083333336 | 0.96 |
| 44481.1875 | 0.88 |
| 44481.197916666664 | 0.84 |
| 44481.208333333336 | 0.72 |
| 44481.21875 | 0.81 |
| 44481.229166666664 | 0.82 |
| 44481.239583333336 | 0.9 |
| 44481.25 | 0.7 |
| 44481.260416666664 | 0.76 |
| 44481.270833333336 | 0.71 |
| 44481.28125 | 0.83 |
| 44481.291666666664 | 0.73 |
| 44481.302083333336 | 0.79 |
| 44481.3125 | 0.64 |
| 44481.322916666664 | 0.85 |
| 44481.333333333336 | 0.64 |
| 44481.34375 | 0.75 |
| 44481.354166666664 | 0.65 |
| 44481.364583333336 | 0.66 |
| 44481.375 | 0.85 |
| 44481.385416666664 | 0.66 |
| 44481.395833333336 | 0.87 |
| 44481.40625 | 0.66 |
| 44481.416666666664 | 0.84 |
| 44481.427083333336 | 0.91 |
| 44481.4375 | 0.63 |
| 44481.447916666664 | 0.81 |
| 44481.458333333336 | 0.96 |
| 44481.46875 | 0.91 |
| 44481.479166666664 | 0.9 |
| 44481.489583333336 | 1.04 |
| 44481.5 | 1.1 |
| 44481.510416666664 | 0.99 |
| 44481.520833333336 | 0.87 |
| 44481.53125 | 0.97 |
| 44481.541666666664 | 0.89 |
| 44481.552083333336 | 0.94 |
| 44481.5625 | 1.17 |
| 44481.572916666664 | 1.2 |
| 44481.583333333336 | 1.12 |
| 44481.59375 | 1.21 |
| 44481.604166666664 | 1.16 |
| 44481.614583333336 | 1.09 |
| 44481.625 | 1.09 |
| 44481.635416666664 | 1.04 |
| 44481.645833333336 | 1.02 |
| 44481.65625 | 1.03 |
| 44481.666666666664 | 0.98 |
| 44481.677083333336 | 1.16 |
| 44481.6875 | 1.01 |
| 44481.697916666664 | 1.08 |
| 44481.708333333336 | 1.07 |
| 44481.71875 | 1.24 |
| 44481.729166666664 | 1.16 |
| 44481.739583333336 | 1.19 |
| 44481.75 | 1.09 |
| 44481.760416666664 | 1.18 |
| 44481.770833333336 | 1.38 |
| 44481.78125 | 1.25 |
| 44481.791666666664 | 1.46 |
| 44481.802083333336 | 1.49 |
| 44481.8125 | 1.48 |
| 44481.822916666664 | 1.43 |
| 44481.833333333336 | 1.51 |
| 44481.84375 | 1.49 |
| 44481.854166666664 | 1.52 |
| 44481.864583333336 | 1.58 |
| 44481.875 | 1.8 |
| 44481.885416666664 | 1.49 |
| 44481.895833333336 | 1.9 |
| 44481.90625 | 1.73 |
| 44481.916666666664 | 1.93 |
| 44481.927083333336 | 2.05 |
| 44481.9375 | 2.04 |
| 44481.947916666664 | 1.92 |
| 44481.958333333336 | 2 |
| 44481.96875 | 1.9 |
| 44481.979166666664 | 1.81 |
| 44481.989583333336 | 1.74 |
| 44482.0 | 1.84 |
| 44482.010416666664 | 1.8 |
| 44482.020833333336 | 1.63 |
| 44482.03125 | 1.87 |
| 44482.041666666664 | 2.61 |
| 44482.052083333336 | 2.39 |
| 44482.0625 | 2.06 |
| 44482.072916666664 | 2.25 |
| 44482.083333333336 | 2.33 |
| 44482.09375 | 1.87 |
| 44482.104166666664 | 1.92 |
| 44482.114583333336 | 1.92 |
| 44482.125 | 1.98 |
| 44482.135416666664 | 1.74 |
| 44482.145833333336 | 1.56 |
| 44482.15625 | 1.33 |
| 44482.166666666664 | 1.37 |
| 44482.177083333336 | 1.51 |
| 44482.1875 | 1.37 |
| 44482.197916666664 | 1.48 |
| 44482.208333333336 | 1.24 |
| 44482.21875 | 1.42 |
| 44482.229166666664 | 1.43 |
| 44482.239583333336 | 1.39 |
| 44482.25 | 1.29 |
| 44482.260416666664 | 1.35 |
| 44482.270833333336 | 1.31 |
| 44482.28125 | 1.22 |
| 44482.291666666664 | 1.06 |
| 44482.302083333336 | 1.02 |
| 44482.3125 | 1.04 |
| 44482.322916666664 | 0.96 |
| 44482.333333333336 | 0.99 |
| 44482.34375 | 1.01 |
| 44482.354166666664 | 1.04 |
| 44482.364583333336 | 1.06 |
| 44482.375 | 0.99 |
| 44482.385416666664 | 1.07 |
| 44482.395833333336 | 1.1 |
| 44482.40625 | 1.15 |
| 44482.416666666664 | 1.19 |
| 44482.427083333336 | 1.08 |
| 44482.4375 | 0.94 |
| 44482.447916666664 | 1.03 |
| 44482.458333333336 | 1.31 |
| 44482.46875 | 1.05 |
| 44482.479166666664 | 1.16 |
| 44482.489583333336 | 1.29 |
| 44482.5 | 1.21 |
| 44482.510416666664 | 1.26 |
| 44482.520833333336 | 1.4 |
| 44482.53125 | 1.33 |
| 44482.541666666664 | 1.41 |
| 44482.552083333336 | 1.47 |
| 44482.5625 | 1.4 |
| 44482.572916666664 | 1.31 |
| 44482.583333333336 | 1.27 |
| 44482.59375 | 1.09 |
| 44482.604166666664 | 1.09 |
| 44482.614583333336 | 1.22 |
| 44482.625 | 1.17 |
| 44482.635416666664 | 1.17 |
| 44482.645833333336 | 1.02 |
| 44482.65625 | 1.05 |
| 44482.666666666664 | 0.95 |
| 44482.677083333336 | 1.05 |
| 44482.6875 | 1.12 |
| 44482.697916666664 | 1.01 |
| 44482.708333333336 | 1.16 |
| 44482.71875 | 1.06 |
| 44482.729166666664 | 1.14 |
| 44482.739583333336 | 1.13 |
| 44482.75 | 1.16 |
| 44482.760416666664 | 1.17 |
| 44482.770833333336 | 1.1 |
| 44482.78125 | 1.26 |
| 44482.791666666664 | 1.28 |
| 44482.802083333336 | 1.29 |
| 44482.8125 | 1.24 |
| 44482.822916666664 | 1.59 |
| 44482.833333333336 | 1.69 |
| 44482.84375 | 1.59 |
| 44482.854166666664 | 1.5 |
| 44482.864583333336 | 1.36 |
| 44482.875 | 1.49 |
| 44482.885416666664 | 1.67 |
| 44482.895833333336 | 1.94 |
| 44482.90625 | 1.78 |
| 44482.916666666664 | 1.64 |
| 44482.927083333336 | 1.89 |
| 44482.9375 | 1.89 |
| 44482.947916666664 | 2.35 |
| 44482.958333333336 | 2.12 |
| 44482.96875 | 2.12 |
| 44482.979166666664 | 2.07 |
| 44482.989583333336 | 1.95 |
| 44483.0 | 1.86 |
| 44483.010416666664 | 1.75 |
| 44483.020833333336 | 1.81 |
| 44483.03125 | 1.74 |
| 44483.041666666664 | 1.78 |
| 44483.052083333336 | 1.95 |
| 44483.0625 | 2.04 |
| 44483.072916666664 | 2.13 |
| 44483.083333333336 | 2.28 |
| 44483.09375 | 2.38 |
| 44483.104166666664 | 2.14 |
| 44483.114583333336 | 2.26 |
| 44483.125 | 2.13 |
| 44483.135416666664 | 2 |
| 44483.145833333336 | 1.82 |
| 44483.15625 | 1.68 |
| 44483.166666666664 | 1.83 |
| 44483.177083333336 | 1.83 |
| 44483.1875 | 1.85 |
| 44483.197916666664 | 1.44 |
| 44483.208333333336 | 1.59 |
| 44483.21875 | 1.73 |
| 44483.229166666664 | 1.78 |
| 44483.239583333336 | 1.72 |
| 44483.25 | 1.43 |
| 44483.260416666664 | 1.58 |
| 44483.270833333336 | 1.58 |
| 44483.28125 | 1.66 |
| 44483.291666666664 | 1.68 |
| 44483.302083333336 | 1.43 |
| 44483.3125 | 1.67 |
| 44483.322916666664 | 1.63 |
| 44483.333333333336 | 1.43 |
| 44483.34375 | 1.56 |
| 44483.354166666664 | 1.53 |
| 44483.364583333336 | 1.47 |
| 44483.375 | 1.45 |
| 44483.385416666664 | 1.11 |
| 44483.395833333336 | 1.13 |
| 44483.40625 | 1.08 |
| 44483.416666666664 | 1.18 |
| 44483.427083333336 | 0.99 |
| 44483.4375 | 1.14 |
| 44483.447916666664 | 1.15 |
| 44483.458333333336 | 1.21 |
| 44483.46875 | 1.22 |
| 44483.479166666664 | 1.13 |
| 44483.489583333336 | 1.19 |
| 44483.5 | 1.17 |
| 44483.510416666664 | 1.16 |
| 44483.520833333336 | 1.39 |
| 44483.53125 | 1.47 |
| 44483.541666666664 | 1.46 |
| 44483.552083333336 | 1.46 |
| 44483.5625 | 1.59 |
| 44483.572916666664 | 1.55 |
| 44483.583333333336 | 1.73 |
| 44483.59375 | 1.48 |
| 44483.604166666664 | 1.89 |
| 44483.614583333336 | 1.4 |
| 44483.625 | 1.36 |
| 44483.635416666664 | 1.21 |
| 44483.645833333336 | 0.98 |
| 44483.65625 | 0.98 |
| 44483.666666666664 | 0.96 |
| 44483.677083333336 | 1.02 |
| 44483.6875 | 1.01 |
| 44483.697916666664 | 0.89 |
| 44483.708333333336 | 0.98 |
| 44483.71875 | 0.98 |
| 44483.729166666664 | 1.06 |
| 44483.739583333336 | 1.05 |
| 44483.75 | 1.03 |
| 44483.760416666664 | 0.98 |
| 44483.770833333336 | 1.23 |
| 44483.78125 | 1.09 |
| 44483.791666666664 | 1.1 |
| 44483.802083333336 | 1.16 |
| 44483.8125 | 1.46 |
| 44483.822916666664 | 1.38 |
| 44483.833333333336 | 1.3 |
| 44483.84375 | 1.27 |
| 44483.854166666664 | 1.57 |
| 44483.864583333336 | 1.57 |
| 44483.875 | 1.49 |
| 44483.885416666664 | 1.13 |
| 44483.895833333336 | 1.63 |
| 44483.90625 | 1.43 |
| 44483.916666666664 | 1.7 |
| 44483.927083333336 | 1.68 |
| 44483.9375 | 1.99 |
| 44483.947916666664 | 2 |
| 44483.958333333336 | 2.44 |
| 44483.96875 | 2.07 |
| 44483.979166666664 | 2.46 |
| 44483.989583333336 | 2.3 |
| 44484.0 | 2.07 |
| 44484.010416666664 | 2.03 |
| 44484.020833333336 | 1.72 |
| 44484.03125 | 1.81 |
| 44484.041666666664 | 1.64 |
| 44484.052083333336 | 1.81 |
| 44484.0625 | 1.93 |
| 44484.072916666664 | 1.9 |
| 44484.083333333336 | 2.01 |
| 44484.09375 | 1.93 |
| 44484.104166666664 | 1.99 |
| 44484.114583333336 | 2 |
| 44484.125 | 2.44 |
| 44484.135416666664 | 2.62 |
| 44484.145833333336 | 2.23 |
| 44484.15625 | 2.02 |
| 44484.166666666664 | 1.86 |
| 44484.177083333336 | 1.8 |
| 44484.1875 | 1.7 |
| 44484.197916666664 | 1.72 |
| 44484.208333333336 | 1.74 |
| 44484.21875 | 1.4 |
| 44484.229166666664 | 1.46 |
| 44484.239583333336 | 1.65 |
| 44484.25 | 1.52 |
| 44484.260416666664 | 1.78 |
| 44484.270833333336 | 1.56 |
| 44484.28125 | 1.43 |
| 44484.291666666664 | 1.67 |
| 44484.302083333336 | 1.65 |
| 44484.3125 | 1.39 |
| 44484.322916666664 | 1.48 |
| 44484.333333333336 | 1.45 |
| 44484.34375 | 1.88 |
| 44484.354166666664 | 1.57 |
| 44484.364583333336 | 1.53 |
| 44484.375 | 1.45 |
| 44484.385416666664 | 1.36 |
| 44484.395833333336 | 2.32 |
| 44484.40625 | 1.52 |
| 44484.416666666664 | 1.14 |
| 44484.427083333336 | 1.21 |
| 44484.4375 | 1.13 |
| 44484.447916666664 | 1.07 |
| 44484.458333333336 | 1.08 |
| 44484.46875 | 0.92 |
| 44484.479166666664 | 1.21 |
| 44484.489583333336 | 0.99 |
| 44484.5 | 0.98 |
| 44484.510416666664 | 1.1 |
| 44484.520833333336 | 1.13 |
| 44484.53125 | 1.06 |
| 44484.541666666664 | 1.22 |
| 44484.552083333336 | 1.17 |
| 44484.5625 | 1.3 |
| 44484.572916666664 | 1.32 |
| 44484.583333333336 | 1.37 |
| 44484.59375 | 1.5 |
| 44484.604166666664 | 1.43 |
| 44484.614583333336 | 1.56 |
| 44484.625 | 1.76 |
| 44484.635416666664 | 1.71 |
| 44484.645833333336 | 1.5 |
| 44484.65625 | 1.46 |
| 44484.666666666664 | 1.64 |
| 44484.677083333336 | 1.42 |
| 44484.6875 | 1.24 |
| 44484.697916666664 | 1.25 |
| 44484.708333333336 | 1.26 |
| 44484.71875 | 1.18 |
| 44484.729166666664 | 1.46 |
| 44484.739583333336 | 1.16 |
| 44484.75 | 1.21 |
| 44484.760416666664 | 1.24 |
| 44484.770833333336 | 1.28 |
| 44484.78125 | 1.43 |
| 44484.791666666664 | 1.33 |
| 44484.802083333336 | 1.29 |
| 44484.8125 | 1.59 |
| 44484.822916666664 | 1.41 |
| 44484.833333333336 | 1.49 |
| 44484.84375 | 1.73 |
| 44484.854166666664 | 1.8 |
| 44484.864583333336 | 1.87 |
| 44484.875 | 1.87 |
| 44484.885416666664 | 2.14 |
| 44484.895833333336 | 1.97 |
| 44484.90625 | 2.35 |
| 44484.916666666664 | 2.4 |
| 44484.927083333336 | 2.47 |
| 44484.9375 | 3.42 |
| 44484.947916666664 | 2.7 |
| 44484.958333333336 | 2.46 |
| 44484.96875 | 2.59 |
| 44484.979166666664 | 2.65 |
| 44484.989583333336 | 2.51 |
| 44485.0 | 2.69 |
| 44485.010416666664 | 2.62 |
| 44485.020833333336 | 2.5 |
| 44485.03125 | 2.44 |
| 44485.041666666664 | 2.37 |
| 44485.052083333336 | 2.29 |
| 44485.0625 | 2.34 |
| 44485.072916666664 | 2.29 |
| 44485.083333333336 | 2.29 |
| 44485.09375 | 2.36 |
| 44485.104166666664 | 2.46 |
| 44485.114583333336 | 2.46 |
| 44485.125 | 2.47 |
| 44485.135416666664 | 2.6 |
| 44485.145833333336 | 2.49 |
| 44485.15625 | 3.07 |
| 44485.166666666664 | 3.11 |
| 44485.177083333336 | 2.58 |
| 44485.1875 | 2.48 |
| 44485.197916666664 | 2.21 |
| 44485.208333333336 | 2.19 |
| 44485.21875 | 1.93 |
| 44485.229166666664 | 1.87 |
| 44485.239583333336 | 1.88 |
| 44485.25 | 1.92 |
| 44485.260416666664 | 1.91 |
| 44485.270833333336 | 1.74 |
| 44485.28125 | 1.74 |
| 44485.291666666664 | 1.72 |
| 44485.302083333336 | 1.75 |
| 44485.3125 | 1.69 |
| 44485.322916666664 | 1.66 |
| 44485.333333333336 | 1.53 |
| 44485.34375 | 1.51 |
| 44485.354166666664 | 1.59 |
| 44485.364583333336 | 1.47 |
| 44485.375 | 1.29 |
| 44485.385416666664 | 1.73 |
| 44485.395833333336 | 1.54 |
| 44485.40625 | 1.63 |
| 44485.416666666664 | 1.71 |
| 44485.427083333336 | 1.61 |
| 44485.4375 | 1.54 |
| 44485.447916666664 | 1.44 |
| 44485.458333333336 | 1.36 |
| 44485.46875 | 1.31 |
| 44485.479166666664 | 1.28 |
| 44485.489583333336 | 1.13 |
| 44485.5 | 1.17 |
| 44485.510416666664 | 1.31 |
| 44485.520833333336 | 1.19 |
| 44485.53125 | 1.3 |
| 44485.541666666664 | 1.31 |
| 44485.552083333336 | 1.26 |
| 44485.5625 | 1.28 |
| 44485.572916666664 | 1.28 |
| 44485.583333333336 | 1.25 |
| 44485.59375 | 1.33 |
| 44485.604166666664 | 1.59 |
| 44485.614583333336 | 1.47 |
| 44485.625 | 1.58 |
| 44485.635416666664 | 1.66 |
| 44485.645833333336 | 1.76 |
| 44485.65625 | 1.95 |
| 44485.666666666664 | 2.06 |
| 44485.677083333336 | 2.19 |
| 44485.6875 | 2.01 |
| 44485.697916666664 | 1.69 |
| 44485.708333333336 | 1.87 |
| 44485.71875 | 1.59 |
| 44485.729166666664 | 1.66 |
| 44485.739583333336 | 1.35 |
| 44485.75 | 1.46 |
| 44485.760416666664 | 1.6 |
| 44485.770833333336 | 1.81 |
| 44485.78125 | 1.63 |
| 44485.791666666664 | 1.85 |
| 44485.802083333336 | 1.76 |
| 44485.8125 | 1.92 |
| 44485.822916666664 | 1.81 |
| 44485.833333333336 | 2.08 |
| 44485.84375 | 2.19 |
| 44485.854166666664 | 2.1 |
| 44485.864583333336 | 2.05 |
| 44485.875 | 2.01 |
| 44485.885416666664 | 2.09 |
| 44485.895833333336 | 2.13 |
| 44485.90625 | 2.47 |
| 44485.916666666664 | 3.14 |
| 44485.927083333336 | 2.68 |
| 44485.9375 | 3.15 |
| 44485.947916666664 | 3.2 |
| 44485.958333333336 | 2.96 |
| 44485.96875 | 2.78 |
| 44485.979166666664 | 2.87 |
| 44485.989583333336 | 2.56 |
| 44486.0 | 2.8 |
| 44486.010416666664 | 2.7 |
| 44486.020833333336 | 2.87 |
| 44486.03125 | 2.36 |
| 44486.041666666664 | 2.36 |
| 44486.052083333336 | 2.44 |
| 44486.0625 | 2.25 |
| 44486.072916666664 | 2.3 |
| 44486.083333333336 | 2.33 |
| 44486.09375 | 2.04 |
| 44486.104166666664 | 2.1 |
| 44486.114583333336 | 2.31 |
| 44486.125 | 2.31 |
| 44486.135416666664 | 2.56 |
| 44486.145833333336 | 2.77 |
| 44486.15625 | 2.83 |
| 44486.166666666664 | 2.88 |
| 44486.177083333336 | 3.13 |
| 44486.1875 | 2.84 |
| 44486.197916666664 | 2.39 |
| 44486.208333333336 | 2.44 |
| 44486.21875 | 2.27 |
| 44486.229166666664 | 1.99 |
| 44486.239583333336 | 2.53 |
| 44486.25 | 2.03 |
| 44486.260416666664 | 2.04 |
| 44486.270833333336 | 1.93 |
| 44486.28125 | 1.76 |
| 44486.291666666664 | 1.7 |
| 44486.302083333336 | 1.6 |
| 44486.3125 | 1.78 |
| 44486.322916666664 | 1.68 |
| 44486.333333333336 | 1.83 |
| 44486.34375 | 1.8 |
| 44486.354166666664 | 1.61 |
| 44486.364583333336 | 1.65 |
| 44486.375 | 1.8 |
| 44486.385416666664 | 1.81 |
| 44486.395833333336 | 1.73 |
| 44486.40625 | 1.68 |
| 44486.416666666664 | 1.64 |
| 44486.427083333336 | 1.45 |
| 44486.4375 | 1.55 |
| 44486.447916666664 | 1.43 |
| 44486.458333333336 | 1.78 |
| 44486.46875 | 1.51 |
| 44486.479166666664 | 1.21 |
| 44486.489583333336 | 1.55 |
| 44486.5 | 1.28 |
| 44486.510416666664 | 1.3 |
| 44486.520833333336 | 1.25 |
| 44486.53125 | 1.4 |
| 44486.541666666664 | 1.35 |
| 44486.552083333336 | 1.25 |
| 44486.5625 | 1.2 |
| 44486.572916666664 | 1.24 |
| 44486.583333333336 | 1.22 |
| 44486.59375 | 1.07 |
| 44486.604166666664 | 0.95 |
| 44486.614583333336 | 1.13 |
| 44486.625 | 1.14 |
| 44486.635416666664 | 1.15 |
| 44486.645833333336 | 1.26 |
| 44486.65625 | 1.4 |
| 44486.666666666664 | 1.53 |
| 44486.677083333336 | 1.58 |
| 44486.6875 | 1.6 |
| 44486.697916666664 | 1.61 |
| 44486.708333333336 | 1.64 |
| 44486.71875 | 1.29 |
| 44486.729166666664 | 1.25 |
| 44486.739583333336 | 1.29 |
| 44486.75 | 1.19 |
| 44486.760416666664 | 1.14 |
| 44486.770833333336 | 1.03 |
| 44486.78125 | 1.27 |
| 44486.791666666664 | 1.47 |
| 44486.802083333336 | 1.4 |
| 44486.8125 | 1.6 |
| 44486.822916666664 | 1.64 |
| 44486.833333333336 | 1.55 |
| 44486.84375 | 1.55 |
| 44486.854166666664 | 1.54 |
| 44486.864583333336 | 1.51 |
| 44486.875 | 1.58 |
| 44486.885416666664 | 1.41 |
| 44486.895833333336 | 1.5 |
| 44486.90625 | 1.55 |
| 44486.916666666664 | 1.71 |
| 44486.927083333336 | 1.9 |
| 44486.9375 | 2.48 |
| 44486.947916666664 | 2.95 |
| 44486.958333333336 | 3.5 |
| 44486.96875 | 3.01 |
| 44486.979166666664 | 2.93 |
| 44486.989583333336 | 3.58 |
| 44487.0 | 3.76 |
| 44487.010416666664 | 3.29 |
| 44487.020833333336 | 2.98 |
| 44487.03125 | 2.61 |
| 44487.041666666664 | 2.34 |
| 44487.052083333336 | 2.26 |
| 44487.0625 | 2.42 |
| 44487.072916666664 | 2.03 |
| 44487.083333333336 | 2.45 |
| 44487.09375 | 2.18 |
| 44487.104166666664 | 2.23 |
| 44487.114583333336 | 2.18 |
| 44487.125 | 1.98 |
| 44487.135416666664 | 1.96 |
| 44487.145833333336 | 1.96 |
| 44487.15625 | 2.09 |
| 44487.166666666664 | 2.18 |
| 44487.177083333336 | 2.11 |
| 44487.1875 | 2.12 |
| 44487.197916666664 | 2.02 |
| 44487.208333333336 | 1.85 |
| 44487.21875 | 2.01 |
| 44487.229166666664 | 2.02 |
| 44487.239583333336 | 2.22 |
| 44487.25 | 2.31 |
| 44487.260416666664 | 1.73 |
| 44487.270833333336 | 1.68 |
| 44487.28125 | 1.8 |
| 44487.291666666664 | 1.58 |
| 44487.302083333336 | 1.69 |
| 44487.3125 | 1.67 |
| 44487.322916666664 | 1.51 |
| 44487.333333333336 | 1.54 |
| 44487.34375 | 1.5 |
| 44487.354166666664 | 1.51 |
| 44487.364583333336 | 1.49 |
| 44487.375 | 1.55 |
| 44487.385416666664 | 1.5 |
| 44487.395833333336 | 1.37 |
| 44487.40625 | 1.56 |
| 44487.416666666664 | 1.55 |
| 44487.427083333336 | 1.6 |
| 44487.4375 | 1.64 |
| 44487.447916666664 | 1.55 |
| 44487.458333333336 | 1.63 |
| 44487.46875 | 1.67 |
| 44487.479166666664 | 1.39 |
| 44487.489583333336 | 1.3 |
| 44487.5 | 1.08 |
| 44487.510416666664 | 1.15 |
| 44487.520833333336 | 1.06 |
| 44487.53125 | 1.18 |
| 44487.541666666664 | 1.05 |
| 44487.552083333336 | 0.88 |
| 44487.5625 | 0.83 |
| 44487.572916666664 | 1.04 |
| 44487.583333333336 | 0.86 |
| 44487.59375 | 0.92 |
| 44487.604166666664 | 0.84 |
| 44487.614583333336 | 0.88 |
| 44487.625 | 0.86 |
| 44487.635416666664 | 0.85 |
| 44487.645833333336 | 0.8 |
| 44487.65625 | 1.07 |
| 44487.666666666664 | 1.04 |
| 44487.677083333336 | 1.15 |
| 44487.6875 | 1.06 |
| 44487.697916666664 | 1.38 |
| 44487.708333333336 | 1.49 |
| 44487.71875 | 1.52 |
| 44487.729166666664 | 1.78 |
| 44487.739583333336 | 1.58 |
| 44487.75 | 1.74 |
| 44487.760416666664 | 1.1 |
| 44487.770833333336 | 1.26 |
| 44487.78125 | 1.45 |
| 44487.791666666664 | 1.22 |
| 44487.802083333336 | 1.31 |
| 44487.8125 | 1.27 |
| 44487.822916666664 | 1.48 |
| 44487.833333333336 | 1.48 |
| 44487.84375 | 1.46 |
| 44487.854166666664 | 1.49 |
| 44487.864583333336 | 1.32 |
| 44487.875 | 1.3 |
| 44487.885416666664 | 1.21 |
| 44487.895833333336 | 1.27 |
| 44487.90625 | 1.25 |
| 44487.916666666664 | 1.48 |
| 44487.927083333336 | 1.61 |
| 44487.9375 | 1.78 |
| 44487.947916666664 | 2.04 |
| 44487.958333333336 | 2.05 |
| 44487.96875 | 2.09 |
| 44487.979166666664 | 2.07 |
| 44487.989583333336 | 2 |
| 44488.0 | 2.54 |
| 44488.010416666664 | 2.68 |
| 44488.020833333336 | 2.45 |
| 44488.03125 | 2.21 |
| 44488.041666666664 | 2.06 |
| 44488.052083333336 | 2.16 |
| 44488.0625 | 1.89 |
| 44488.072916666664 | 1.81 |
| 44488.083333333336 | 1.82 |
| 44488.09375 | 1.7 |
| 44488.104166666664 | 1.78 |
| 44488.114583333336 | 1.65 |
| 44488.125 | 1.58 |
| 44488.135416666664 | 1.55 |
| 44488.145833333336 | 1.61 |
| 44488.15625 | 1.45 |
| 44488.166666666664 | 1.58 |
| 44488.177083333336 | 1.48 |
| 44488.1875 | 1.55 |
| 44488.197916666664 | 1.58 |
| 44488.208333333336 | 1.76 |
| 44488.21875 | 1.82 |
| 44488.229166666664 | 1.71 |
| 44488.239583333336 | 1.69 |
| 44488.25 | 1.97 |
| 44488.260416666664 | 1.78 |
| 44488.270833333336 | 1.98 |
| 44488.28125 | 1.53 |
| 44488.291666666664 | 1.53 |
| 44488.302083333336 | 1.14 |
| 44488.3125 | 1.19 |
| 44488.322916666664 | 1.24 |
| 44488.333333333336 | 1.19 |
| 44488.34375 | 1.23 |
| 44488.354166666664 | 1.25 |
| 44488.364583333336 | 1.15 |
| 44488.375 | 1.01 |
| 44488.385416666664 | 1.24 |
| 44488.395833333336 | 1.14 |
| 44488.40625 | 1.05 |
| 44488.416666666664 | 1.01 |
| 44488.427083333336 | 1.08 |
| 44488.4375 | 1.18 |
| 44488.447916666664 | 1.15 |
| 44488.458333333336 | 1.31 |
| 44488.46875 | 1.24 |
| 44488.479166666664 | 1.01 |
| 44488.489583333336 | 0.94 |
| 44488.5 | 0.94 |
| 44488.510416666664 | 1.01 |
| 44488.520833333336 | 0.98 |
| 44488.53125 | 0.92 |
| 44488.541666666664 | 0.82 |
| 44488.552083333336 | 1.03 |
| 44488.5625 | 0.73 |
| 44488.572916666664 | 0.75 |
| 44488.583333333336 | 0.56 |
| 44488.59375 | 0.73 |
| 44488.604166666664 | 0.8 |
| 44488.614583333336 | 0.57 |
| 44488.625 | 0.68 |
| 44488.635416666664 | 0.77 |
| 44488.645833333336 | 0.67 |
| 44488.65625 | 0.57 |
| 44488.666666666664 | 0.67 |
| 44488.677083333336 | 0.57 |
| 44488.6875 | 0.69 |
| 44488.697916666664 | 1.02 |
| 44488.708333333336 | 0.85 |
| 44488.71875 | 0.83 |
| 44488.729166666664 | 1.23 |
| 44488.739583333336 | 1.2 |
| 44488.75 | 1.17 |
| 44488.760416666664 | 1.14 |
| 44488.770833333336 | 1.44 |
| 44488.78125 | 1.45 |
| 44488.791666666664 | 1.13 |
| 44488.802083333336 | 1.2 |
| 44488.8125 | 1.3 |
| 44488.822916666664 | 1.32 |
| 44488.833333333336 | 1.14 |
| 44488.84375 | 1.22 |
| 44488.854166666664 | 1.28 |
| 44488.864583333336 | 1.26 |
| 44488.875 | 1.21 |
| 44488.885416666664 | 1.19 |
| 44488.895833333336 | 1.23 |
| 44488.90625 | 1.09 |
| 44488.916666666664 | 1.17 |
| 44488.927083333336 | 0.96 |
| 44488.9375 | 1.18 |
| 44488.947916666664 | 1.29 |
| 44488.958333333336 | 1.38 |
| 44488.96875 | 1.63 |
| 44488.979166666664 | 1.58 |
| 44488.989583333336 | 1.52 |
| 44489.0 | 1.59 |
| 44489.010416666664 | 1.68 |
| 44489.020833333336 | 1.42 |
| 44489.03125 | 1.89 |
| 44489.041666666664 | 1.87 |
| 44489.052083333336 | 2.38 |
| 44489.0625 | 2.41 |
| 44489.072916666664 | 1.84 |
| 44489.083333333336 | 1.87 |
| 44489.09375 | 1.51 |
| 44489.104166666664 | 1.49 |
| 44489.114583333336 | 1.51 |
| 44489.125 | 1.38 |
| 44489.135416666664 | 1.27 |
| 44489.145833333336 | 1.46 |
| 44489.15625 | 1.28 |
| 44489.166666666664 | 1.32 |
| 44489.177083333336 | 1.32 |
| 44489.1875 | 1.25 |
| 44489.197916666664 | 1.36 |
| 44489.208333333336 | 1.36 |
| 44489.21875 | 1.51 |
| 44489.229166666664 | 1.41 |
| 44489.239583333336 | 1.43 |
| 44489.25 | 1.29 |
| 44489.260416666664 | 1.36 |
| 44489.270833333336 | 1.62 |
| 44489.28125 | 1.47 |
| 44489.291666666664 | 1.49 |
| 44489.302083333336 | 1.13 |
| 44489.3125 | 1.36 |
| 44489.322916666664 | 1.44 |
| 44489.333333333336 | 0.94 |
| 44489.34375 | 0.87 |
| 44489.354166666664 | 1.02 |
| 44489.364583333336 | 1.03 |
| 44489.375 | 1.08 |
| 44489.385416666664 | 1.07 |
| 44489.395833333336 | 1.03 |
| 44489.40625 | 1.05 |
| 44489.416666666664 | 0.94 |
| 44489.427083333336 | 0.97 |
| 44489.4375 | 0.93 |
| 44489.447916666664 | 1.02 |
| 44489.458333333336 | 0.95 |
| 44489.46875 | 0.95 |
| 44489.479166666664 | 0.88 |
| 44489.489583333336 | 0.91 |
| 44489.5 | 0.82 |
| 44489.510416666664 | 0.83 |
| 44489.520833333336 | 0.9 |
| 44489.53125 | 0.94 |
| 44489.541666666664 | 0.86 |
| 44489.552083333336 | 1 |
| 44489.5625 | 0.89 |
| 44489.572916666664 | 1.19 |
| 44489.583333333336 | 0.8 |
| 44489.59375 | 0.54 |
| 44489.604166666664 | 0.7 |
| 44489.614583333336 | 0.58 |
| 44489.625 | 0.61 |
| 44489.635416666664 | 0.56 |
| 44489.645833333336 | 0.62 |
| 44489.65625 | 0.53 |
| 44489.666666666664 | 0.58 |
| 44489.677083333336 | 0.68 |
| 44489.6875 | 0.72 |
| 44489.697916666664 | 0.91 |
| 44489.708333333336 | 1.07 |
| 44489.71875 | 0.82 |
| 44489.729166666664 | 1.07 |
| 44489.739583333336 | 1.1 |
| 44489.75 | 1.1 |
| 44489.760416666664 | 1.31 |
| 44489.770833333336 | 1.19 |
| 44489.78125 | 1.56 |
| 44489.791666666664 | 1.37 |
| 44489.802083333336 | 1.6 |
| 44489.8125 | 1.61 |
| 44489.822916666664 | 1.47 |
| 44489.833333333336 | 1.67 |
| 44489.84375 | 1.52 |
| 44489.854166666664 | 1.41 |
| 44489.864583333336 | 1.33 |
| 44489.875 | 1.22 |
| 44489.885416666664 | 1.42 |
| 44489.895833333336 | 1.17 |
| 44489.90625 | 1.3 |
| 44489.916666666664 | 1.19 |
| 44489.927083333336 | 1.2 |
| 44489.9375 | 1.29 |
| 44489.947916666664 | 1.12 |
| 44489.958333333336 | 1.11 |
| 44489.96875 | 1.14 |
| 44489.979166666664 | 1.13 |
| 44489.989583333336 | 1.23 |
| 44490.0 | 1.23 |
| 44490.010416666664 | 1.54 |
| 44490.020833333336 | 1.45 |
| 44490.03125 | 1.3 |
| 44490.041666666664 | 1.58 |
| 44490.052083333336 | 1.74 |
| 44490.0625 | 2.11 |
| 44490.072916666664 | 1.66 |
| 44490.083333333336 | 2.02 |
| 44490.09375 | 1.69 |
| 44490.104166666664 | 1.72 |
| 44490.114583333336 | 1.63 |
| 44490.125 | 1.44 |
| 44490.135416666664 | 1.25 |
| 44490.145833333336 | 1.07 |
| 44490.15625 | 1.21 |
| 44490.166666666664 | 1.24 |
| 44490.177083333336 | 1.19 |
| 44490.1875 | 1.32 |
| 44490.197916666664 | 1.18 |
| 44490.208333333336 | 1.29 |
| 44490.21875 | 1.38 |
| 44490.229166666664 | 1.45 |
| 44490.239583333336 | 1.28 |
| 44490.25 | 1.31 |
| 44490.260416666664 | 1.36 |
| 44490.270833333336 | 1.45 |
| 44490.28125 | 1.29 |
| 44490.291666666664 | 1.5 |
| 44490.302083333336 | 1.58 |
| 44490.3125 | 1.56 |
| 44490.322916666664 | 1.14 |
| 44490.333333333336 | 1.2 |
| 44490.34375 | 0.94 |
| 44490.354166666664 | 1.03 |
| 44490.364583333336 | 0.9 |
| 44490.375 | 0.93 |
| 44490.385416666664 | 1.03 |
| 44490.395833333336 | 1.1 |
| 44490.40625 | 0.92 |
| 44490.416666666664 | 1.03 |
| 44490.427083333336 | 0.98 |
| 44490.4375 | 0.94 |
| 44490.447916666664 | 0.99 |
| 44490.458333333336 | 1 |
| 44490.46875 | 0.91 |
| 44490.479166666664 | 0.77 |
| 44490.489583333336 | 0.81 |
| 44490.5 | 0.92 |
| 44490.510416666664 | 0.91 |
| 44490.520833333336 | 0.96 |
| 44490.53125 | 0.96 |
| 44490.541666666664 | 0.99 |
| 44490.552083333336 | 0.91 |
| 44490.5625 | 0.95 |
| 44490.572916666664 | 0.79 |
| 44490.583333333336 | 0.57 |
| 44490.59375 | 0.73 |
| 44490.604166666664 | 0.81 |
| 44490.614583333336 | 0.81 |
| 44490.625 | 0.66 |
| 44490.635416666664 | 0.55 |
| 44490.645833333336 | 0.53 |
| 44490.65625 | 0.71 |
| 44490.666666666664 | 0.68 |
| 44490.677083333336 | 0.67 |
| 44490.6875 | 0.62 |
| 44490.697916666664 | 0.64 |
| 44490.708333333336 | 0.66 |
| 44490.71875 | 0.88 |
| 44490.729166666664 | 0.93 |
| 44490.739583333336 | 0.97 |
| 44490.75 | 0.93 |
| 44490.760416666664 | 1.36 |
| 44490.770833333336 | 1.15 |
| 44490.78125 | 1.25 |
| 44490.791666666664 | 1.43 |
| 44490.802083333336 | 1.48 |
| 44490.8125 | 1.56 |
| 44490.822916666664 | 1.57 |
| 44490.833333333336 | 1.85 |
| 44490.84375 | 2.23 |
| 44490.854166666664 | 1.66 |
| 44490.864583333336 | 1.53 |
| 44490.875 | 1.75 |
| 44490.885416666664 | 1.5 |
| 44490.895833333336 | 1.47 |
| 44490.90625 | 1.35 |
| 44490.916666666664 | 1.44 |
| 44490.927083333336 | 1.55 |
| 44490.9375 | 1.9 |
| 44490.947916666664 | 1.9 |
| 44490.958333333336 | 1.92 |
| 44490.96875 | 1.73 |
| 44490.979166666664 | 1.7 |
| 44490.989583333336 | 1.75 |
| 44491.0 | 1.65 |
| 44491.010416666664 | 1.62 |
| 44491.020833333336 | 1.52 |
| 44491.03125 | 1.77 |
| 44491.041666666664 | 1.64 |
| 44491.052083333336 | 1.75 |
| 44491.0625 | 1.65 |
| 44491.072916666664 | 1.88 |
| 44491.083333333336 | 2.37 |
| 44491.09375 | 1.8 |
| 44491.104166666664 | 1.45 |
| 44491.114583333336 | 1.47 |
| 44491.125 | 1.79 |
| 44491.135416666664 | 1.52 |
| 44491.145833333336 | 1.5 |
| 44491.15625 | 1.45 |
| 44491.166666666664 | 1.36 |
| 44491.177083333336 | 1.45 |
| 44491.1875 | 1.41 |
| 44491.197916666664 | 1.5 |
| 44491.208333333336 | 1.49 |
| 44491.21875 | 1.67 |
| 44491.229166666664 | 1.56 |
| 44491.239583333336 | 1.6 |
| 44491.25 | 1.54 |
| 44491.260416666664 | 1.54 |
| 44491.270833333336 | 1.42 |
| 44491.28125 | 1.43 |
| 44491.291666666664 | 1.41 |
| 44491.302083333336 | 1.37 |
| 44491.3125 | 1.42 |
| 44491.322916666664 | 1.42 |
| 44491.333333333336 | 1.29 |
| 44491.34375 | 1.11 |
| 44491.354166666664 | 1.22 |
| 44491.364583333336 | 1.15 |
| 44491.375 | 1.14 |
| 44491.385416666664 | 1.08 |
| 44491.395833333336 | 1.15 |
| 44491.40625 | 1.14 |
| 44491.416666666664 | 1.21 |
| 44491.427083333336 | 1.25 |
| 44491.4375 | 1.19 |
| 44491.447916666664 | 1.05 |
| 44491.458333333336 | 1.09 |
| 44491.46875 | 1.16 |
| 44491.479166666664 | 1.07 |
| 44491.489583333336 | 0.92 |
| 44491.5 | 0.94 |
| 44491.510416666664 | 0.92 |
| 44491.520833333336 | 0.92 |
| 44491.53125 | 0.91 |
| 44491.541666666664 | 0.93 |
| 44491.552083333336 | 0.95 |
| 44491.5625 | 0.86 |
| 44491.572916666664 | 0.9 |
| 44491.583333333336 | 1.21 |
| 44491.59375 | 0.88 |
| 44491.604166666664 | 1.02 |
| 44491.614583333336 | 1.13 |
| 44491.625 | 1.06 |
| 44491.635416666664 | 0.96 |
| 44491.645833333336 | 1.07 |
| 44491.65625 | 0.93 |
| 44491.666666666664 | 1.06 |
| 44491.677083333336 | 1.09 |
| 44491.6875 | 0.99 |
| 44491.697916666664 | 1.17 |
| 44491.708333333336 | 0.95 |
| 44491.71875 | 1.13 |
| 44491.729166666664 | 1.14 |
| 44491.739583333336 | 1.23 |
| 44491.75 | 1.35 |
| 44491.760416666664 | 1.4 |
| 44491.770833333336 | 1.54 |
| 44491.78125 | 1.42 |
| 44491.791666666664 | 1.88 |
| 44491.802083333336 | 1.82 |
| 44491.8125 | 1.66 |
| 44491.822916666664 | 1.89 |
| 44491.833333333336 | 2.13 |
| 44491.84375 | 2.27 |
| 44491.854166666664 | 2.62 |
| 44491.864583333336 | 2.63 |
| 44491.875 | 2.13 |
| 44491.885416666664 | 1.88 |
| 44491.895833333336 | 2.02 |
| 44491.90625 | 1.91 |
| 44491.916666666664 | 1.65 |
| 44491.927083333336 | 1.69 |
| 44491.9375 | 1.87 |
| 44491.947916666664 | 2.03 |
| 44491.958333333336 | 1.83 |
| 44491.96875 | 1.86 |
| 44491.979166666664 | 1.8 |
| 44491.989583333336 | 1.79 |
| 44492.0 | 1.78 |
| 44492.010416666664 | 1.7 |
| 44492.020833333336 | 1.68 |
| 44492.03125 | 1.69 |
| 44492.041666666664 | 1.75 |
| 44492.052083333336 | 1.7 |
| 44492.0625 | 1.58 |
| 44492.072916666664 | 1.63 |
| 44492.083333333336 | 1.77 |
| 44492.09375 | 1.74 |
| 44492.104166666664 | 1.85 |
| 44492.114583333336 | 1.91 |
| 44492.125 | 2.4 |
| 44492.135416666664 | 2.52 |
| 44492.145833333336 | 2.25 |
| 44492.15625 | 2.15 |
| 44492.166666666664 | 1.77 |
| 44492.177083333336 | 1.61 |
| 44492.1875 | 1.86 |
| 44492.197916666664 | 1.65 |
| 44492.208333333336 | 1.79 |
| 44492.21875 | 1.59 |
| 44492.229166666664 | 1.59 |
| 44492.239583333336 | 1.5 |
| 44492.25 | 1.69 |
| 44492.260416666664 | 1.77 |
| 44492.270833333336 | 1.74 |
| 44492.28125 | 1.57 |
| 44492.291666666664 | 1.62 |
| 44492.302083333336 | 1.77 |
| 44492.3125 | 1.56 |
| 44492.322916666664 | 1.56 |
| 44492.333333333336 | 1.54 |
| 44492.34375 | 1.72 |
| 44492.354166666664 | 1.59 |
| 44492.364583333336 | 1.36 |
| 44492.375 | 1.38 |
| 44492.385416666664 | 1.13 |
| 44492.395833333336 | 1.28 |
| 44492.40625 | 1.48 |
| 44492.416666666664 | 1.24 |
| 44492.427083333336 | 1.3 |
| 44492.4375 | 1.14 |
| 44492.447916666664 | 1.18 |
| 44492.458333333336 | 1.27 |
| 44492.46875 | 1.33 |
| 44492.479166666664 | 1.13 |
| 44492.489583333336 | 1.12 |
| 44492.5 | 0.98 |
| 44492.510416666664 | 1.03 |
| 44492.520833333336 | 1.07 |
| 44492.53125 | 1.07 |
| 44492.541666666664 | 0.92 |
| 44492.552083333336 | 0.94 |
| 44492.5625 | 0.74 |
| 44492.572916666664 | 0.72 |
| 44492.583333333336 | 0.75 |
| 44492.59375 | 0.89 |
| 44492.604166666664 | 0.96 |
| 44492.614583333336 | 0.96 |
| 44492.625 | 0.83 |
| 44492.635416666664 | 0.97 |
| 44492.645833333336 | 0.98 |
| 44492.65625 | 0.94 |
| 44492.666666666664 | 0.9 |
| 44492.677083333336 | 0.6 |
| 44492.6875 | 1.02 |
| 44492.697916666664 | 1 |
| 44492.708333333336 | 1.08 |
| 44492.71875 | 1.06 |
| 44492.729166666664 | 0.87 |
| 44492.739583333336 | 0.79 |
| 44492.75 | 1.09 |
| 44492.760416666664 | 1.12 |
| 44492.770833333336 | 1.23 |
| 44492.78125 | 1.18 |
| 44492.791666666664 | 1.49 |
| 44492.802083333336 | 1.32 |
| 44492.8125 | 1.5 |
| 44492.822916666664 | 1.39 |
| 44492.833333333336 | 1.44 |
| 44492.84375 | 1.46 |
| 44492.854166666664 | 1.33 |
| 44492.864583333336 | 1.43 |
| 44492.875 | 1.8 |
| 44492.885416666664 | 2.13 |
| 44492.895833333336 | 2.22 |
| 44492.90625 | 1.87 |
| 44492.916666666664 | 1.97 |
| 44492.927083333336 | 1.69 |
| 44492.9375 | 1.62 |
| 44492.947916666664 | 1.64 |
| 44492.958333333336 | 1.61 |
| 44492.96875 | 1.73 |
| 44492.979166666664 | 1.68 |
| 44492.989583333336 | 1.64 |
| 44493.0 | 1.45 |
| 44493.010416666664 | 1.53 |
| 44493.020833333336 | 1.81 |
| 44493.03125 | 1.58 |
| 44493.041666666664 | 1.68 |
| 44493.052083333336 | 1.52 |
| 44493.0625 | 1.44 |
| 44493.072916666664 | 1.34 |
| 44493.083333333336 | 1.42 |
| 44493.09375 | 1.65 |
| 44493.104166666664 | 1.27 |
| 44493.114583333336 | 1.3 |
| 44493.125 | 1.46 |
| 44493.135416666664 | 1.56 |
| 44493.145833333336 | 1.61 |
| 44493.15625 | 1.83 |
| 44493.166666666664 | 1.7 |
| 44493.177083333336 | 1.65 |
| 44493.1875 | 1.24 |
| 44493.197916666664 | 1.33 |
| 44493.208333333336 | 1.32 |
| 44493.21875 | 1.43 |
| 44493.229166666664 | 1.49 |
| 44493.239583333336 | 1.35 |
| 44493.25 | 1.35 |
| 44493.260416666664 | 1.3 |
| 44493.270833333336 | 1.4 |
| 44493.28125 | 1.23 |
| 44493.291666666664 | 1.4 |
| 44493.302083333336 | 1.43 |
| 44493.3125 | 1.21 |
| 44493.322916666664 | 1.31 |
| 44493.333333333336 | 1.3 |
| 44493.34375 | 1.37 |
| 44493.354166666664 | 1.35 |
| 44493.364583333336 | 1.38 |
| 44493.375 | 1.36 |
| 44493.385416666664 | 1.43 |
| 44493.395833333336 | 1.5 |
| 44493.40625 | 1.35 |
| 44493.416666666664 | 1.22 |
| 44493.427083333336 | 0.92 |
| 44493.4375 | 0.99 |
| 44493.447916666664 | 0.95 |
| 44493.458333333336 | 0.97 |
| 44493.46875 | 1.02 |
| 44493.479166666664 | 0.94 |
| 44493.489583333336 | 0.81 |
| 44493.5 | 0.92 |
| 44493.510416666664 | 0.89 |
| 44493.520833333336 | 0.94 |
| 44493.53125 | 0.91 |
| 44493.541666666664 | 0.92 |
| 44493.552083333336 | 0.97 |
| 44493.5625 | 0.93 |
| 44493.572916666664 | 0.74 |
| 44493.583333333336 | 0.84 |
| 44493.59375 | 0.91 |
| 44493.604166666664 | 0.8 |
| 44493.614583333336 | 0.9 |
| 44493.625 | 0.87 |
| 44493.635416666664 | 0.75 |
| 44493.645833333336 | 0.74 |
| 44493.65625 | 0.61 |
| 44493.666666666664 | 0.57 |
| 44493.677083333336 | 0.62 |
| 44493.6875 | 0.69 |
| 44493.697916666664 | 0.59 |
| 44493.708333333336 | 0.52 |
| 44493.71875 | 0.67 |
| 44493.729166666664 | 0.6 |
| 44493.739583333336 | 0.71 |
| 44493.75 | 0.71 |
| 44493.760416666664 | 0.76 |
| 44493.770833333336 | 0.69 |
| 44493.78125 | 1.01 |
| 44493.791666666664 | 0.92 |
| 44493.802083333336 | 0.84 |
| 44493.8125 | 0.95 |
| 44493.822916666664 | 1.08 |
| 44493.833333333336 | 1.02 |
| 44493.84375 | 1.11 |
| 44493.854166666664 | 1.08 |
| 44493.864583333336 | 1.21 |
| 44493.875 | 1.36 |
| 44493.885416666664 | 1.28 |
| 44493.895833333336 | 1.49 |
| 44493.90625 | 1.38 |
| 44493.916666666664 | 1.76 |
| 44493.927083333336 | 1.67 |
| 44493.9375 | 1.55 |
| 44493.947916666664 | 1.43 |
| 44493.958333333336 | 1.28 |
| 44493.96875 | 1.29 |
| 44493.979166666664 | 1.2 |
| 44493.989583333336 | 1.06 |
| 44494.0 | 1.18 |
| 44494.010416666664 | 1.26 |
| 44494.020833333336 | 1.31 |
| 44494.03125 | 1.14 |
| 44494.041666666664 | 1.17 |
| 44494.052083333336 | 1.09 |
| 44494.0625 | 1.04 |
| 44494.072916666664 | 1.18 |
| 44494.083333333336 | 1.08 |
| 44494.09375 | 1.02 |
| 44494.104166666664 | 1.05 |
| 44494.114583333336 | 1.14 |
| 44494.125 | 1.04 |
| 44494.135416666664 | 1.03 |
| 44494.145833333336 | 1.13 |
| 44494.15625 | 1.06 |
| 44494.166666666664 | 1.23 |
| 44494.177083333336 | 1.29 |
| 44494.1875 | 1.34 |
| 44494.197916666664 | 1.33 |
| 44494.208333333336 | 1.19 |
| 44494.21875 | 1.02 |
| 44494.229166666664 | 0.97 |
| 44494.239583333336 | 1.05 |
| 44494.25 | 1.09 |
| 44494.260416666664 | 1.11 |
| 44494.270833333336 | 0.94 |
| 44494.28125 | 1.11 |
| 44494.291666666664 | 1.05 |
| 44494.302083333336 | 1 |
| 44494.3125 | 1.07 |
| 44494.322916666664 | 0.92 |
| 44494.333333333336 | 0.98 |
| 44494.34375 | 1.03 |
| 44494.354166666664 | 0.91 |
| 44494.364583333336 | 1 |
| 44494.375 | 0.89 |
| 44494.385416666664 | 1.09 |
| 44494.395833333336 | 1.12 |
| 44494.40625 | 0.82 |
| 44494.416666666664 | 1.04 |
| 44494.427083333336 | 0.96 |
| 44494.4375 | 0.91 |
| 44494.447916666664 | 0.89 |
| 44494.458333333336 | 0.87 |
| 44494.46875 | 0.77 |
| 44494.479166666664 | 0.75 |
| 44494.489583333336 | 0.64 |
| 44494.5 | 0.73 |
| 44494.510416666664 | 0.72 |
| 44494.520833333336 | 0.78 |
| 44494.53125 | 0.69 |
| 44494.541666666664 | 0.73 |
| 44494.552083333336 | 0.77 |
| 44494.5625 | 0.85 |
| 44494.572916666664 | 0.86 |
| 44494.583333333336 | 0.75 |
| 44494.59375 | 0.57 |
| 44494.604166666664 | 0.75 |
| 44494.614583333336 | 0.69 |
| 44494.625 | 0.69 |
| 44494.635416666664 | 0.63 |
| 44494.645833333336 | 0.76 |
| 44494.65625 | 0.7 |
| 44494.666666666664 | 0.73 |
| 44494.677083333336 | 0.78 |
| 44494.6875 | 0.74 |
| 44494.697916666664 | 0.82 |
| 44494.708333333336 | 0.94 |
| 44494.71875 | 1.09 |
| 44494.729166666664 | 1.6 |
| 44494.739583333336 | 1.09 |
| 44494.75 | 1.03 |
| 44494.760416666664 | 1.05 |
| 44494.770833333336 | 1.11 |
| 44494.78125 | 1.1 |
| 44494.791666666664 | 1.16 |
| 44494.802083333336 | 1.25 |
| 44494.8125 | 1.06 |
| 44494.822916666664 | 1.15 |
| 44494.833333333336 | 1.18 |
| 44494.84375 | 1.16 |
| 44494.854166666664 | 1.13 |
| 44494.864583333336 | 1.28 |
| 44494.875 | 1.4 |
| 44494.885416666664 | 1.59 |
| 44494.895833333336 | 1.51 |
| 44494.90625 | 1.36 |
| 44494.916666666664 | 1.43 |
| 44494.927083333336 | 1.83 |
| 44494.9375 | 1.72 |
| 44494.947916666664 | 2.34 |
| 44494.958333333336 | 1.5 |
| 44494.96875 | 1.41 |
| 44494.979166666664 | 1.46 |
| 44494.989583333336 | 1.41 |
| 44495.0 | 1.28 |
| 44495.010416666664 | 1.22 |
| 44495.020833333336 | 1.07 |
| 44495.03125 | 1.21 |
| 44495.041666666664 | 1 |
| 44495.052083333336 | 1.16 |
| 44495.0625 | 1.24 |
| 44495.072916666664 | 1.1 |
| 44495.083333333336 | 0.91 |
| 44495.09375 | 0.97 |
| 44495.104166666664 | 1.01 |
| 44495.114583333336 | 1.05 |
| 44495.125 | 1.02 |
| 44495.135416666664 | 1.11 |
| 44495.145833333336 | 1.11 |
| 44495.15625 | 1.27 |
| 44495.166666666664 | 1.03 |
| 44495.177083333336 | 1.09 |
| 44495.1875 | 1.45 |
| 44495.197916666664 | 1.05 |
| 44495.208333333336 | 1.21 |
| 44495.21875 | 1.21 |
| 44495.229166666664 | 1.3 |
| 44495.239583333336 | 0.94 |
| 44495.25 | 1.09 |
| 44495.260416666664 | 1.08 |
| 44495.270833333336 | 1.18 |
| 44495.28125 | 1.11 |
| 44495.291666666664 | 1.05 |
| 44495.302083333336 | 1.06 |
| 44495.3125 | 0.97 |
| 44495.322916666664 | 1.28 |
| 44495.333333333336 | 1.21 |
| 44495.34375 | 1.05 |
| 44495.354166666664 | 0.98 |
| 44495.364583333336 | 1.09 |
| 44495.375 | 0.99 |
| 44495.385416666664 | 1.01 |
| 44495.395833333336 | 1.01 |
| 44495.40625 | 0.8 |
| 44495.416666666664 | 1.08 |
| 44495.427083333336 | 0.94 |
| 44495.4375 | 0.87 |
| 44495.447916666664 | 0.91 |
| 44495.458333333336 | 1.26 |
| 44495.46875 | 1.02 |
| 44495.479166666664 | 1.05 |
| 44495.489583333336 | 1.11 |
| 44495.5 | 0.71 |
| 44495.510416666664 | 0.79 |
| 44495.520833333336 | 0.59 |
| 44495.53125 | 0.72 |
| 44495.541666666664 | 0.72 |
| 44495.552083333336 | 0.71 |
| 44495.5625 | 0.65 |
| 44495.572916666664 | 0.68 |
| 44495.583333333336 | 0.67 |
| 44495.59375 | 0.84 |
| 44495.604166666664 | 0.69 |
| 44495.614583333336 | 0.73 |
| 44495.625 | 0.56 |
| 44495.635416666664 | 0.66 |
| 44495.645833333336 | 0.5 |
| 44495.65625 | 0.59 |
| 44495.666666666664 | 0.59 |
| 44495.677083333336 | 0.59 |
| 44495.6875 | 0.39 |
| 44495.697916666664 | 0.73 |
| 44495.708333333336 | 0.52 |
| 44495.71875 | 0.64 |
| 44495.729166666664 | 0.8 |
| 44495.739583333336 | 0.86 |
| 44495.75 | 0.91 |
| 44495.760416666664 | 0.89 |
| 44495.770833333336 | 0.8 |
| 44495.78125 | 0.9 |
| 44495.791666666664 | 1.06 |
| 44495.802083333336 | 1.13 |
| 44495.8125 | 1.07 |
| 44495.822916666664 | 0.99 |
| 44495.833333333336 | 1.18 |
| 44495.84375 | 1.22 |
| 44495.854166666664 | 1.12 |
| 44495.864583333336 | 0.95 |
| 44495.875 | 1.24 |
| 44495.885416666664 | 1.09 |
| 44495.895833333336 | 1.2 |
| 44495.90625 | 1.23 |
| 44495.916666666664 | 1.23 |
| 44495.927083333336 | 1.34 |
| 44495.9375 | 1.52 |
| 44495.947916666664 | 1.54 |
| 44495.958333333336 | 1.79 |
| 44495.96875 | 2.02 |
| 44495.979166666664 | 1.79 |
| 44495.989583333336 | 1.44 |
| 44496.0 | 1.48 |
| 44496.010416666664 | 1.45 |
| 44496.020833333336 | 1.03 |
| 44496.03125 | 1.2 |
| 44496.041666666664 | 1.34 |
| 44496.052083333336 | 1.16 |
| 44496.0625 | 1.07 |
| 44496.072916666664 | 1.06 |
| 44496.083333333336 | 1.27 |
| 44496.09375 | 1.41 |
| 44496.104166666664 | 1.28 |
| 44496.114583333336 | 1.23 |
| 44496.125 | 1.2 |
| 44496.135416666664 | 1.35 |
| 44496.145833333336 | 1.14 |
| 44496.15625 | 1.22 |
| 44496.166666666664 | 1.14 |
| 44496.177083333336 | 1.32 |
| 44496.1875 | 1.37 |
| 44496.197916666664 | 1.34 |
| 44496.208333333336 | 1.52 |
| 44496.21875 | 1.39 |
| 44496.229166666664 | 1.16 |
| 44496.239583333336 | 1.35 |
| 44496.25 | 1.73 |
| 44496.260416666664 | 1.8 |
| 44496.270833333336 | 1.24 |
| 44496.28125 | 1.4 |
| 44496.291666666664 | 1.35 |
| 44496.302083333336 | 1.32 |
| 44496.3125 | 1.25 |
| 44496.322916666664 | 1.28 |
| 44496.333333333336 | 1.18 |
| 44496.34375 | 1.16 |
| 44496.354166666664 | 1.14 |
| 44496.364583333336 | 1.08 |
| 44496.375 | 1.16 |
| 44496.385416666664 | 1 |
| 44496.395833333336 | 0.94 |
| 44496.40625 | 1.09 |
| 44496.416666666664 | 1.09 |
| 44496.427083333336 | 1.31 |
| 44496.4375 | 1.03 |
| 44496.447916666664 | 1.35 |
| 44496.458333333336 | 1.3 |
| 44496.46875 | 1 |
| 44496.479166666664 | 1.02 |
| 44496.489583333336 | 0.81 |
| 44496.5 | 0.76 |
| 44496.510416666664 | 0.76 |
| 44496.520833333336 | 0.77 |
| 44496.53125 | 0.98 |
| 44496.541666666664 | 0.88 |
| 44496.552083333336 | 0.92 |
| 44496.5625 | 0.79 |
| 44496.572916666664 | 0.88 |
| 44496.583333333336 | 0.71 |
| 44496.59375 | 0.55 |
| 44496.604166666664 | 0.72 |
| 44496.614583333336 | 0.41 |
| 44496.625 | 0.46 |
| 44496.635416666664 | 0.47 |
| 44496.645833333336 | 0.51 |
| 44496.65625 | 0.42 |
| 44496.666666666664 | 0.52 |
| 44496.677083333336 | 0.52 |
| 44496.6875 | 0.37 |
| 44496.697916666664 | 0.48 |
| 44496.708333333336 | 0.66 |
| 44496.71875 | 0.58 |
| 44496.729166666664 | 0.88 |
| 44496.739583333336 | 1.03 |
| 44496.75 | 1.01 |
| 44496.760416666664 | 1.02 |
| 44496.770833333336 | 0.91 |
| 44496.78125 | 0.87 |
| 44496.791666666664 | 1.57 |
| 44496.802083333336 | 1.06 |
| 44496.8125 | 1.11 |
| 44496.822916666664 | 0.94 |
| 44496.833333333336 | 1.04 |
| 44496.84375 | 0.95 |
| 44496.854166666664 | 1.15 |
| 44496.864583333336 | 1.11 |
| 44496.875 | 1.54 |
| 44496.885416666664 | 1.27 |
| 44496.895833333336 | 1.43 |
| 44496.90625 | 1.5 |
| 44496.916666666664 | 1.32 |
| 44496.927083333336 | 1.43 |
| 44496.9375 | 1.56 |
| 44496.947916666664 | 1.78 |
| 44496.958333333336 | 1.77 |
| 44496.96875 | 1.55 |
| 44496.979166666664 | 1.75 |
| 44496.989583333336 | 1.73 |
| 44497.0 | 1.88 |
| 44497.010416666664 | 1.67 |
| 44497.020833333336 | 2.08 |
| 44497.03125 | 1.88 |
| 44497.041666666664 | 1.97 |
| 44497.052083333336 | 2.1 |
| 44497.0625 | 1.11 |
| 44497.072916666664 | 1.19 |
| 44497.083333333336 | 1.09 |
| 44497.09375 | 1.04 |
| 44497.104166666664 | 0.99 |
| 44497.114583333336 | 0.97 |
| 44497.125 | 1.06 |
| 44497.135416666664 | 1.04 |
| 44497.145833333336 | 0.94 |
| 44497.15625 | 1.03 |
| 44497.166666666664 | 0.91 |
| 44497.177083333336 | 0.93 |
| 44497.1875 | 1.04 |
| 44497.197916666664 | 0.93 |
| 44497.208333333336 | 0.96 |
| 44497.21875 | 0.82 |
| 44497.229166666664 | 0.94 |
| 44497.239583333336 | 1.06 |
| 44497.25 | 0.97 |
| 44497.260416666664 | 1.06 |
| 44497.270833333336 | 1.01 |
| 44497.28125 | 0.99 |
| 44497.291666666664 | 1.15 |
| 44497.302083333336 | 0.92 |
| 44497.3125 | 1 |
| 44497.322916666664 | 1.11 |
| 44497.333333333336 | 1.08 |
| 44497.34375 | 1.03 |
| 44497.354166666664 | 0.81 |
| 44497.364583333336 | 1.09 |
| 44497.375 | 1.09 |
| 44497.385416666664 | 0.94 |
| 44497.395833333336 | 0.99 |
| 44497.40625 | 1.01 |
| 44497.416666666664 | 1.11 |
| 44497.427083333336 | 0.84 |
| 44497.4375 | 1.03 |
| 44497.447916666664 | 0.96 |
| 44497.458333333336 | 1 |
| 44497.46875 | 1.05 |
| 44497.479166666664 | 0.96 |
| 44497.489583333336 | 1 |
| 44497.5 | 1.11 |
| 44497.510416666664 | 1.06 |
| 44497.520833333336 | 1 |
| 44497.53125 | 0.99 |
| 44497.541666666664 | 0.78 |
| 44497.552083333336 | 0.68 |
| 44497.5625 | 0.62 |
| 44497.572916666664 | 0.72 |
| 44497.583333333336 | 0.71 |
| 44497.59375 | 0.72 |
| 44497.604166666664 | 0.62 |
| 44497.614583333336 | 0.62 |
| 44497.625 | 0.62 |
| 44497.635416666664 | 0.59 |
| 44497.645833333336 | 0.56 |
| 44497.65625 | 0.57 |
| 44497.666666666664 | 0.41 |
| 44497.677083333336 | 0.43 |
| 44497.6875 | 0.46 |
| 44497.697916666664 | 0.56 |
| 44497.708333333336 | 0.66 |
| 44497.71875 | 0.57 |
| 44497.729166666664 | 0.59 |
| 44497.739583333336 | 0.65 |
| 44497.75 | 0.69 |
| 44497.760416666664 | 0.7 |
| 44497.770833333336 | 0.7 |
| 44497.78125 | 0.73 |
| 44497.791666666664 | 0.73 |
| 44497.802083333336 | 0.94 |
| 44497.8125 | 1.03 |
| 44497.822916666664 | 1.28 |
| 44497.833333333336 | 1.1 |
| 44497.84375 | 1.28 |
| 44497.854166666664 | 1.02 |
| 44497.864583333336 | 0.96 |
| 44497.875 | 0.94 |
| 44497.885416666664 | 1.17 |
| 44497.895833333336 | 1.24 |
| 44497.90625 | 1.29 |
| 44497.916666666664 | 1.21 |
| 44497.927083333336 | 1.3 |
| 44497.9375 | 1.54 |
| 44497.947916666664 | 1.5 |
| 44497.958333333336 | 1.64 |
| 44497.96875 | 1.5 |
| 44497.979166666664 | 1.38 |
| 44497.989583333336 | 1.42 |
| 44498.0 | 1.42 |
| 44498.010416666664 | 1.3 |
| 44498.020833333336 | 1.37 |
| 44498.03125 | 1.43 |
| 44498.041666666664 | 1.43 |
| 44498.052083333336 | 1.34 |
| 44498.0625 | 1.37 |
| 44498.072916666664 | 1.46 |
| 44498.083333333336 | 1.25 |
| 44498.09375 | 1.51 |
| 44498.104166666664 | 1.42 |
| 44498.114583333336 | 1.33 |
| 44498.125 | 1.02 |
| 44498.135416666664 | 1.06 |
| 44498.145833333336 | 1.1 |
| 44498.15625 | 1.12 |
| 44498.166666666664 | 0.91 |
| 44498.177083333336 | 1 |
| 44498.1875 | 1 |
| 44498.197916666664 | 1.03 |
| 44498.208333333336 | 0.9 |
| 44498.21875 | 0.94 |
| 44498.229166666664 | 0.92 |
| 44498.239583333336 | 0.85 |
| 44498.25 | 0.81 |
| 44498.260416666664 | 0.82 |
| 44498.270833333336 | 0.68 |
| 44498.28125 | 0.86 |
| 44498.291666666664 | 1.07 |
| 44498.302083333336 | 0.92 |
| 44498.3125 | 1.08 |
| 44498.322916666664 | 0.97 |
| 44498.333333333336 | 1.01 |
| 44498.34375 | 0.91 |
| 44498.354166666664 | 0.84 |
| 44498.364583333336 | 0.87 |
| 44498.375 | 0.78 |
| 44498.385416666664 | 0.93 |
| 44498.395833333336 | 0.91 |
| 44498.40625 | 0.95 |
| 44498.416666666664 | 0.89 |
| 44498.427083333336 | 1 |
| 44498.4375 | 1.06 |
| 44498.447916666664 | 0.88 |
| 44498.458333333336 | 0.97 |
| 44498.46875 | 0.96 |
| 44498.479166666664 | 0.94 |
| 44498.489583333336 | 0.85 |
| 44498.5 | 0.84 |
| 44498.510416666664 | 0.87 |
| 44498.520833333336 | 0.77 |
| 44498.53125 | 0.94 |
| 44498.541666666664 | 0.88 |
| 44498.552083333336 | 1.04 |
| 44498.5625 | 0.97 |
| 44498.572916666664 | 1.01 |
| 44498.583333333336 | 0.84 |
| 44498.59375 | 0.94 |
| 44498.604166666664 | 0.95 |
| 44498.614583333336 | 0.92 |
| 44498.625 | 0.87 |
| 44498.635416666664 | 0.85 |
| 44498.645833333336 | 0.96 |
| 44498.65625 | 0.78 |
| 44498.666666666664 | 0.87 |
| 44498.677083333336 | 0.96 |
| 44498.6875 | 0.83 |
| 44498.697916666664 | 0.88 |
| 44498.708333333336 | 0.93 |
| 44498.71875 | 1 |
| 44498.729166666664 | 0.89 |
| 44498.739583333336 | 0.99 |
| 44498.75 | 1.12 |
| 44498.760416666664 | 1.19 |
| 44498.770833333336 | 1.19 |
| 44498.78125 | 1.01 |
| 44498.791666666664 | 1.2 |
| 44498.802083333336 | 1.26 |
| 44498.8125 | 1.18 |
| 44498.822916666664 | 1.47 |
| 44498.833333333336 | 1.31 |
| 44498.84375 | 1.27 |
| 44498.854166666664 | 1.24 |
| 44498.864583333336 | 1.44 |
| 44498.875 | 1.24 |
| 44498.885416666664 | 1.07 |
| 44498.895833333336 | 1.22 |
| 44498.90625 | 1.23 |
| 44498.916666666664 | 1.21 |
| 44498.927083333336 | 1.22 |
| 44498.9375 | 1.42 |
| 44498.947916666664 | 1.59 |
| 44498.958333333336 | 1.77 |
| 44498.96875 | 2.12 |
| 44498.979166666664 | 2.04 |
| 44498.989583333336 | 1.76 |
| 44499.0 | 1.78 |
| 44499.010416666664 | 1.81 |
| 44499.020833333336 | 1.65 |
| 44499.03125 | 1.75 |
| 44499.041666666664 | 1.58 |
| 44499.052083333336 | 1.67 |
| 44499.0625 | 1.58 |
| 44499.072916666664 | 1.63 |
| 44499.083333333336 | 2.27 |
| 44499.09375 | 1.96 |
| 44499.104166666664 | 1.89 |
| 44499.114583333336 | 1.61 |
| 44499.125 | 1.45 |
| 44499.135416666664 | 1.46 |
| 44499.145833333336 | 1.21 |
| 44499.15625 | 1.34 |
| 44499.166666666664 | 1.17 |
| 44499.177083333336 | 1.08 |
| 44499.1875 | 1.24 |
| 44499.197916666664 | 1.14 |
| 44499.208333333336 | 1.09 |
| 44499.21875 | 1.1 |
| 44499.229166666664 | 1.13 |
| 44499.239583333336 | 1.07 |
| 44499.25 | 1.43 |
| 44499.260416666664 | 1.36 |
| 44499.270833333336 | 1.21 |
| 44499.28125 | 1.34 |
| 44499.291666666664 | 1.21 |
| 44499.302083333336 | 1.24 |
| 44499.3125 | 1.28 |
| 44499.322916666664 | 1.36 |
| 44499.333333333336 | 1.23 |
| 44499.34375 | 1.41 |
| 44499.354166666664 | 1.18 |
| 44499.364583333336 | 1.32 |
| 44499.375 | 1.36 |
| 44499.385416666664 | 1.19 |
| 44499.395833333336 | 1.24 |
| 44499.40625 | 1.19 |
| 44499.416666666664 | 1.18 |
| 44499.427083333336 | 1.02 |
| 44499.4375 | 0.84 |
| 44499.447916666664 | 0.76 |
| 44499.458333333336 | 0.99 |
| 44499.46875 | 0.97 |
| 44499.479166666664 | 0.93 |
| 44499.489583333336 | 0.8 |
| 44499.5 | 0.85 |
| 44499.510416666664 | 0.91 |
| 44499.520833333336 | 0.94 |
| 44499.53125 | 0.94 |
| 44499.541666666664 | 0.84 |
| 44499.552083333336 | 0.83 |
| 44499.5625 | 0.77 |
| 44499.572916666664 | 0.68 |
| 44499.583333333336 | 0.62 |
| 44499.59375 | 0.85 |
| 44499.604166666664 | 0.72 |
| 44499.614583333336 | 0.73 |
| 44499.625 | 0.53 |
| 44499.635416666664 | 0.5 |
| 44499.645833333336 | 0.45 |
| 44499.65625 | 0.44 |
| 44499.666666666664 | 0.47 |
| 44499.677083333336 | 0.47 |
| 44499.6875 | 0.3 |
| 44499.697916666664 | 0.36 |
| 44499.708333333336 | 0.62 |
| 44499.71875 | 0.55 |
| 44499.729166666664 | 0.61 |
| 44499.739583333336 | 0.68 |
| 44499.75 | 0.69 |
| 44499.760416666664 | 0.65 |
| 44499.770833333336 | 0.73 |
| 44499.78125 | 0.68 |
| 44499.791666666664 | 0.83 |
| 44499.802083333336 | 0.77 |
| 44499.8125 | 0.74 |
| 44499.822916666664 | 0.78 |
| 44499.833333333336 | 0.68 |
| 44499.84375 | 0.98 |
| 44499.854166666664 | 0.83 |
| 44499.864583333336 | 1.18 |
| 44499.875 | 1.04 |
| 44499.885416666664 | 0.93 |
| 44499.895833333336 | 1.22 |
| 44499.90625 | 1.31 |
| 44499.916666666664 | 1.17 |
| 44499.927083333336 | 1.12 |
| 44499.9375 | 1.27 |
| 44499.947916666664 | 1.43 |
| 44499.958333333336 | 1.5 |
| 44499.96875 | 1.55 |
| 44499.979166666664 | 1.46 |
| 44499.989583333336 | 1.45 |
| 44500.0 | 1.36 |
| 44500.010416666664 | 1.26 |
| 44500.020833333336 | 1.34 |
| 44500.03125 | 1.29 |
| 44500.041666666664 | 1.17 |
| 44500.052083333336 | 1.24 |
| 44500.0625 | 1.1 |
| 44500.072916666664 | 1.24 |
| 44500.083333333336 | 1.21 |
| 44500.09375 | 1.18 |
| 44500.104166666664 | 1.05 |
| 44500.114583333336 | 1.15 |
| 44500.125 | 1.2 |
| 44500.135416666664 | 1.31 |
| 44500.145833333336 | 1.34 |
| 44500.15625 | 1.34 |
| 44500.166666666664 | 1.03 |
| 44500.177083333336 | 1.06 |
| 44500.1875 | 0.85 |
| 44500.197916666664 | 0.99 |
| 44500.208333333336 | 0.97 |
| 44500.21875 | 0.86 |
| 44500.229166666664 | 0.95 |
| 44500.239583333336 | 0.84 |
| 44500.25 | 0.83 |
| 44500.260416666664 | 0.84 |
| 44500.270833333336 | 0.79 |
| 44500.28125 | 0.82 |
| 44500.291666666664 | 0.93 |
| 44500.302083333336 | 0.73 |
| 44500.3125 | 0.9 |
| 44500.322916666664 | 0.96 |
| 44500.333333333336 | 0.84 |
| 44500.34375 | 0.82 |
| 44500.354166666664 | 0.82 |
| 44500.364583333336 | 0.8 |
| 44500.375 | 0.89 |
| 44500.385416666664 | 0.93 |
| 44500.395833333336 | 0.91 |
| 44500.40625 | 0.9 |
| 44500.416666666664 | 0.88 |
| 44500.427083333336 | 0.86 |
| 44500.4375 | 0.84 |
| 44500.447916666664 | 0.77 |
| 44500.458333333336 | 0.91 |
| 44500.46875 | 0.75 |
| 44500.479166666664 | 0.88 |
| 44500.489583333336 | 0.76 |
| 44500.5 | 0.76 |
| 44500.510416666664 | 0.64 |
| 44500.520833333336 | 0.67 |
| 44500.53125 | 0.79 |
| 44500.541666666664 | 0.75 |
| 44500.552083333336 | 0.77 |
| 44500.5625 | 0.61 |
| 44500.572916666664 | 0.72 |
| 44500.583333333336 | 0.65 |
| 44500.59375 | 0.54 |
| 44500.604166666664 | 0.62 |
| 44500.614583333336 | 0.77 |
| 44500.625 | 0.68 |
| 44500.635416666664 | 0.87 |
| 44500.645833333336 | 0.97 |
| 44500.65625 | 0.75 |
| 44500.666666666664 | 0.54 |
| 44500.677083333336 | 0.57 |
| 44500.6875 | 0.47 |
| 44500.697916666664 | 0.4 |
| 44500.708333333336 | 0.45 |
| 44500.71875 | 0.44 |
| 44500.729166666664 | 0.39 |
| 44500.739583333336 | 0.32 |
| 44500.75 | 0.46 |
| 44500.760416666664 | 0.38 |
| 44500.770833333336 | 0.47 |
| 44500.78125 | 0.57 |
| 44500.791666666664 | 0.56 |
| 44500.802083333336 | 0.52 |
| 44500.8125 | 0.63 |
| 44500.822916666664 | 0.57 |
| 44500.833333333336 | 0.63 |
| 44500.84375 | 0.64 |
| 44500.854166666664 | 0.63 |
| 44500.864583333336 | 0.72 |
| 44500.875 | 0.62 |
| 44500.885416666664 | 0.65 |
| 44500.895833333336 | 0.74 |
| 44500.90625 | 1.13 |
| 44500.916666666664 | 0.72 |
| 44500.927083333336 | 0.83 |
| 44500.9375 | 1.34 |
| 44500.947916666664 | 1.15 |
| 44500.958333333336 | 1.07 |
| 44500.96875 | 1.21 |
| 44500.979166666664 | 1.27 |
| 44500.989583333336 | 1.35 |
| 44501.0 | 1.18 |
| 44501.010416666664 | 1.07 |
| 44501.020833333336 | 1.08 |
| 44501.03125 | 1.13 |
| 44501.041666666664 | 1.04 |
| 44501.052083333336 | 1.03 |
| 44501.0625 | 1.11 |
| 44501.072916666664 | 0.99 |
| 44501.083333333336 | 1.01 |
| 44501.09375 | 1.06 |
| 44501.104166666664 | 0.97 |
| 44501.114583333336 | 1.14 |
| 44501.125 | 1.04 |
| 44501.135416666664 | 1.08 |
| 44501.145833333336 | 1.09 |
| 44501.15625 | 1 |